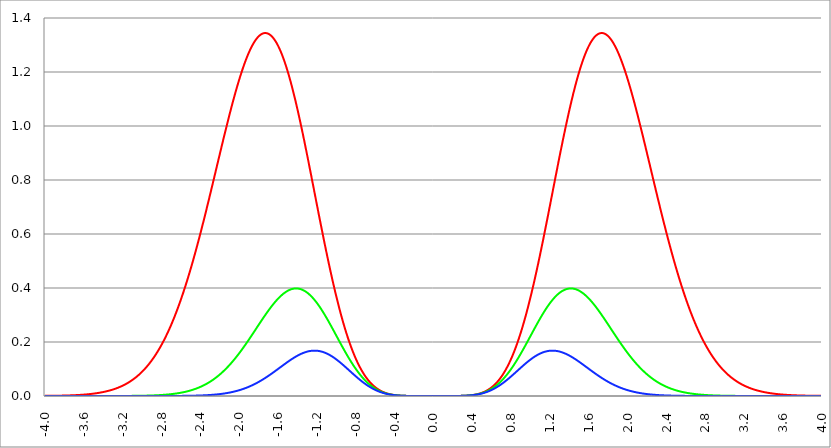
| Category | Series 1 | Series 0 | Series 2 |
|---|---|---|---|
| -4.0 | 0 | 0 | 0 |
| -3.996 | 0 | 0 | 0 |
| -3.992 | 0 | 0 | 0 |
| -3.988 | 0 | 0 | 0 |
| -3.984 | 0.001 | 0 | 0 |
| -3.98 | 0.001 | 0 | 0 |
| -3.976 | 0.001 | 0 | 0 |
| -3.972 | 0.001 | 0 | 0 |
| -3.968 | 0.001 | 0 | 0 |
| -3.964 | 0.001 | 0 | 0 |
| -3.96 | 0.001 | 0 | 0 |
| -3.956 | 0.001 | 0 | 0 |
| -3.952 | 0.001 | 0 | 0 |
| -3.948 | 0.001 | 0 | 0 |
| -3.944 | 0.001 | 0 | 0 |
| -3.94 | 0.001 | 0 | 0 |
| -3.936 | 0.001 | 0 | 0 |
| -3.932 | 0.001 | 0 | 0 |
| -3.928 | 0.001 | 0 | 0 |
| -3.924 | 0.001 | 0 | 0 |
| -3.92 | 0.001 | 0 | 0 |
| -3.916 | 0.001 | 0 | 0 |
| -3.912 | 0.001 | 0 | 0 |
| -3.908 | 0.001 | 0 | 0 |
| -3.904 | 0.001 | 0 | 0 |
| -3.9 | 0.001 | 0 | 0 |
| -3.896 | 0.001 | 0 | 0 |
| -3.892 | 0.001 | 0 | 0 |
| -3.888 | 0.001 | 0 | 0 |
| -3.884 | 0.001 | 0 | 0 |
| -3.88 | 0.001 | 0 | 0 |
| -3.876 | 0.001 | 0 | 0 |
| -3.872 | 0.001 | 0 | 0 |
| -3.868 | 0.001 | 0 | 0 |
| -3.864 | 0.001 | 0 | 0 |
| -3.86 | 0.001 | 0 | 0 |
| -3.856 | 0.001 | 0 | 0 |
| -3.852 | 0.001 | 0 | 0 |
| -3.848 | 0.001 | 0 | 0 |
| -3.844 | 0.001 | 0 | 0 |
| -3.84 | 0.001 | 0 | 0 |
| -3.836 | 0.001 | 0 | 0 |
| -3.832 | 0.001 | 0 | 0 |
| -3.828 | 0.001 | 0 | 0 |
| -3.824 | 0.001 | 0 | 0 |
| -3.82 | 0.001 | 0 | 0 |
| -3.816 | 0.001 | 0 | 0 |
| -3.812 | 0.001 | 0 | 0 |
| -3.808 | 0.002 | 0 | 0 |
| -3.804 | 0.002 | 0 | 0 |
| -3.8 | 0.002 | 0 | 0 |
| -3.796 | 0.002 | 0 | 0 |
| -3.792 | 0.002 | 0 | 0 |
| -3.788 | 0.002 | 0 | 0 |
| -3.784 | 0.002 | 0 | 0 |
| -3.78 | 0.002 | 0 | 0 |
| -3.776 | 0.002 | 0 | 0 |
| -3.772 | 0.002 | 0 | 0 |
| -3.768 | 0.002 | 0 | 0 |
| -3.764 | 0.002 | 0 | 0 |
| -3.76 | 0.002 | 0 | 0 |
| -3.756 | 0.002 | 0 | 0 |
| -3.752 | 0.002 | 0 | 0 |
| -3.748 | 0.002 | 0 | 0 |
| -3.744 | 0.002 | 0 | 0 |
| -3.74 | 0.002 | 0 | 0 |
| -3.736 | 0.002 | 0 | 0 |
| -3.732 | 0.002 | 0 | 0 |
| -3.728 | 0.002 | 0 | 0 |
| -3.724 | 0.003 | 0 | 0 |
| -3.72 | 0.003 | 0 | 0 |
| -3.716 | 0.003 | 0 | 0 |
| -3.712 | 0.003 | 0 | 0 |
| -3.708 | 0.003 | 0 | 0 |
| -3.704 | 0.003 | 0 | 0 |
| -3.7 | 0.003 | 0 | 0 |
| -3.696 | 0.003 | 0 | 0 |
| -3.692 | 0.003 | 0 | 0 |
| -3.688 | 0.003 | 0 | 0 |
| -3.684 | 0.003 | 0 | 0 |
| -3.68 | 0.003 | 0 | 0 |
| -3.676 | 0.003 | 0 | 0 |
| -3.672 | 0.003 | 0 | 0 |
| -3.668 | 0.003 | 0 | 0 |
| -3.664 | 0.004 | 0 | 0 |
| -3.66 | 0.004 | 0 | 0 |
| -3.656 | 0.004 | 0 | 0 |
| -3.652 | 0.004 | 0 | 0 |
| -3.648 | 0.004 | 0 | 0 |
| -3.644 | 0.004 | 0 | 0 |
| -3.64 | 0.004 | 0 | 0 |
| -3.636 | 0.004 | 0 | 0 |
| -3.632 | 0.004 | 0 | 0 |
| -3.628 | 0.004 | 0 | 0 |
| -3.624 | 0.004 | 0 | 0 |
| -3.62 | 0.005 | 0 | 0 |
| -3.616 | 0.005 | 0 | 0 |
| -3.612 | 0.005 | 0 | 0 |
| -3.608 | 0.005 | 0 | 0 |
| -3.604 | 0.005 | 0 | 0 |
| -3.6 | 0.005 | 0 | 0 |
| -3.596 | 0.005 | 0 | 0 |
| -3.592 | 0.005 | 0 | 0 |
| -3.588 | 0.005 | 0 | 0 |
| -3.584 | 0.006 | 0 | 0 |
| -3.58 | 0.006 | 0 | 0 |
| -3.576 | 0.006 | 0 | 0 |
| -3.572 | 0.006 | 0 | 0 |
| -3.568 | 0.006 | 0 | 0 |
| -3.564 | 0.006 | 0 | 0 |
| -3.56 | 0.006 | 0 | 0 |
| -3.556 | 0.007 | 0 | 0 |
| -3.552 | 0.007 | 0 | 0 |
| -3.548 | 0.007 | 0 | 0 |
| -3.544 | 0.007 | 0 | 0 |
| -3.54 | 0.007 | 0 | 0 |
| -3.536 | 0.007 | 0 | 0 |
| -3.532 | 0.007 | 0 | 0 |
| -3.528 | 0.008 | 0 | 0 |
| -3.524 | 0.008 | 0 | 0 |
| -3.52 | 0.008 | 0 | 0 |
| -3.516 | 0.008 | 0 | 0 |
| -3.512 | 0.008 | 0 | 0 |
| -3.508 | 0.008 | 0 | 0 |
| -3.504 | 0.009 | 0 | 0 |
| -3.5 | 0.009 | 0 | 0 |
| -3.496 | 0.009 | 0 | 0 |
| -3.492 | 0.009 | 0 | 0 |
| -3.488 | 0.009 | 0 | 0 |
| -3.484 | 0.01 | 0 | 0 |
| -3.48 | 0.01 | 0 | 0 |
| -3.476 | 0.01 | 0 | 0 |
| -3.472 | 0.01 | 0 | 0 |
| -3.467999999999999 | 0.01 | 0 | 0 |
| -3.463999999999999 | 0.011 | 0 | 0 |
| -3.459999999999999 | 0.011 | 0 | 0 |
| -3.455999999999999 | 0.011 | 0 | 0 |
| -3.451999999999999 | 0.011 | 0 | 0 |
| -3.447999999999999 | 0.012 | 0 | 0 |
| -3.443999999999999 | 0.012 | 0 | 0 |
| -3.439999999999999 | 0.012 | 0 | 0 |
| -3.435999999999999 | 0.012 | 0 | 0 |
| -3.431999999999999 | 0.013 | 0 | 0 |
| -3.427999999999999 | 0.013 | 0 | 0 |
| -3.423999999999999 | 0.013 | 0 | 0 |
| -3.419999999999999 | 0.013 | 0 | 0 |
| -3.415999999999999 | 0.014 | 0 | 0 |
| -3.411999999999999 | 0.014 | 0 | 0 |
| -3.407999999999999 | 0.014 | 0 | 0 |
| -3.403999999999999 | 0.014 | 0 | 0 |
| -3.399999999999999 | 0.015 | 0 | 0 |
| -3.395999999999999 | 0.015 | 0 | 0 |
| -3.391999999999999 | 0.015 | 0 | 0 |
| -3.387999999999999 | 0.016 | 0 | 0 |
| -3.383999999999999 | 0.016 | 0 | 0 |
| -3.379999999999999 | 0.016 | 0 | 0 |
| -3.375999999999999 | 0.017 | 0 | 0 |
| -3.371999999999999 | 0.017 | 0 | 0 |
| -3.367999999999999 | 0.017 | 0 | 0 |
| -3.363999999999999 | 0.018 | 0 | 0 |
| -3.359999999999999 | 0.018 | 0 | 0 |
| -3.355999999999999 | 0.018 | 0 | 0 |
| -3.351999999999999 | 0.019 | 0 | 0 |
| -3.347999999999999 | 0.019 | 0 | 0 |
| -3.343999999999999 | 0.019 | 0 | 0 |
| -3.339999999999999 | 0.02 | 0 | 0 |
| -3.335999999999999 | 0.02 | 0 | 0 |
| -3.331999999999999 | 0.021 | 0 | 0 |
| -3.327999999999999 | 0.021 | 0 | 0 |
| -3.323999999999999 | 0.021 | 0 | 0 |
| -3.319999999999999 | 0.022 | 0 | 0 |
| -3.315999999999999 | 0.022 | 0 | 0 |
| -3.311999999999999 | 0.023 | 0 | 0 |
| -3.307999999999999 | 0.023 | 0 | 0 |
| -3.303999999999999 | 0.024 | 0 | 0 |
| -3.299999999999999 | 0.024 | 0 | 0 |
| -3.295999999999999 | 0.025 | 0 | 0 |
| -3.291999999999999 | 0.025 | 0 | 0 |
| -3.288 | 0.025 | 0 | 0 |
| -3.284 | 0.026 | 0 | 0 |
| -3.279999999999999 | 0.026 | 0 | 0 |
| -3.275999999999999 | 0.027 | 0 | 0 |
| -3.271999999999999 | 0.027 | 0 | 0 |
| -3.268 | 0.028 | 0 | 0 |
| -3.264 | 0.029 | 0 | 0 |
| -3.259999999999999 | 0.029 | 0 | 0 |
| -3.255999999999999 | 0.03 | 0 | 0 |
| -3.251999999999999 | 0.03 | 0 | 0 |
| -3.248 | 0.031 | 0 | 0 |
| -3.244 | 0.031 | 0 | 0 |
| -3.239999999999999 | 0.032 | 0 | 0 |
| -3.235999999999999 | 0.033 | 0 | 0 |
| -3.231999999999999 | 0.033 | 0 | 0 |
| -3.228 | 0.034 | 0 | 0 |
| -3.224 | 0.034 | 0 | 0 |
| -3.219999999999999 | 0.035 | 0 | 0 |
| -3.215999999999999 | 0.036 | 0 | 0 |
| -3.211999999999999 | 0.036 | 0 | 0 |
| -3.208 | 0.037 | 0 | 0 |
| -3.204 | 0.038 | 0 | 0 |
| -3.199999999999999 | 0.038 | 0 | 0 |
| -3.195999999999999 | 0.039 | 0 | 0 |
| -3.191999999999999 | 0.04 | 0 | 0 |
| -3.188 | 0.04 | 0 | 0 |
| -3.184 | 0.041 | 0 | 0 |
| -3.179999999999999 | 0.042 | 0 | 0 |
| -3.175999999999999 | 0.043 | 0 | 0 |
| -3.171999999999999 | 0.043 | 0 | 0 |
| -3.168 | 0.044 | 0 | 0 |
| -3.164 | 0.045 | 0 | 0 |
| -3.159999999999999 | 0.046 | 0 | 0 |
| -3.155999999999999 | 0.047 | 0 | 0 |
| -3.151999999999999 | 0.048 | 0 | 0 |
| -3.148 | 0.048 | 0 | 0 |
| -3.144 | 0.049 | 0 | 0 |
| -3.139999999999999 | 0.05 | 0 | 0 |
| -3.135999999999999 | 0.051 | 0 | 0 |
| -3.131999999999999 | 0.052 | 0 | 0 |
| -3.128 | 0.053 | 0 | 0 |
| -3.124 | 0.054 | 0 | 0 |
| -3.119999999999999 | 0.055 | 0 | 0 |
| -3.115999999999999 | 0.056 | 0 | 0 |
| -3.111999999999999 | 0.057 | 0 | 0 |
| -3.108 | 0.058 | 0 | 0 |
| -3.104 | 0.059 | 0 | 0 |
| -3.099999999999999 | 0.06 | 0 | 0 |
| -3.095999999999999 | 0.061 | 0.001 | 0 |
| -3.091999999999999 | 0.062 | 0.001 | 0 |
| -3.088 | 0.063 | 0.001 | 0 |
| -3.084 | 0.064 | 0.001 | 0 |
| -3.079999999999999 | 0.065 | 0.001 | 0 |
| -3.075999999999999 | 0.066 | 0.001 | 0 |
| -3.071999999999999 | 0.067 | 0.001 | 0 |
| -3.068 | 0.068 | 0.001 | 0 |
| -3.064 | 0.069 | 0.001 | 0 |
| -3.059999999999999 | 0.07 | 0.001 | 0 |
| -3.055999999999999 | 0.072 | 0.001 | 0 |
| -3.051999999999999 | 0.073 | 0.001 | 0 |
| -3.048 | 0.074 | 0.001 | 0 |
| -3.044 | 0.075 | 0.001 | 0 |
| -3.039999999999999 | 0.077 | 0.001 | 0 |
| -3.035999999999999 | 0.078 | 0.001 | 0 |
| -3.031999999999999 | 0.079 | 0.001 | 0 |
| -3.028 | 0.08 | 0.001 | 0 |
| -3.024 | 0.082 | 0.001 | 0 |
| -3.019999999999999 | 0.083 | 0.001 | 0 |
| -3.015999999999999 | 0.084 | 0.001 | 0 |
| -3.011999999999999 | 0.086 | 0.001 | 0 |
| -3.008 | 0.087 | 0.001 | 0 |
| -3.004 | 0.089 | 0.001 | 0 |
| -2.999999999999999 | 0.09 | 0.001 | 0 |
| -2.995999999999999 | 0.091 | 0.001 | 0 |
| -2.991999999999999 | 0.093 | 0.001 | 0 |
| -2.988 | 0.094 | 0.001 | 0 |
| -2.984 | 0.096 | 0.001 | 0 |
| -2.979999999999999 | 0.097 | 0.001 | 0 |
| -2.975999999999999 | 0.099 | 0.001 | 0 |
| -2.971999999999999 | 0.101 | 0.001 | 0 |
| -2.968 | 0.102 | 0.001 | 0 |
| -2.964 | 0.104 | 0.001 | 0 |
| -2.959999999999999 | 0.105 | 0.001 | 0 |
| -2.955999999999999 | 0.107 | 0.001 | 0 |
| -2.951999999999999 | 0.109 | 0.001 | 0 |
| -2.948 | 0.11 | 0.001 | 0 |
| -2.944 | 0.112 | 0.001 | 0 |
| -2.939999999999999 | 0.114 | 0.002 | 0 |
| -2.935999999999999 | 0.116 | 0.002 | 0 |
| -2.931999999999999 | 0.117 | 0.002 | 0 |
| -2.928 | 0.119 | 0.002 | 0 |
| -2.924 | 0.121 | 0.002 | 0 |
| -2.919999999999999 | 0.123 | 0.002 | 0 |
| -2.915999999999999 | 0.125 | 0.002 | 0 |
| -2.911999999999999 | 0.127 | 0.002 | 0 |
| -2.908 | 0.129 | 0.002 | 0 |
| -2.904 | 0.13 | 0.002 | 0 |
| -2.899999999999999 | 0.132 | 0.002 | 0 |
| -2.895999999999999 | 0.134 | 0.002 | 0 |
| -2.891999999999999 | 0.136 | 0.002 | 0 |
| -2.887999999999999 | 0.138 | 0.002 | 0 |
| -2.883999999999999 | 0.141 | 0.002 | 0 |
| -2.879999999999999 | 0.143 | 0.002 | 0 |
| -2.875999999999999 | 0.145 | 0.002 | 0 |
| -2.871999999999999 | 0.147 | 0.002 | 0 |
| -2.867999999999999 | 0.149 | 0.002 | 0 |
| -2.863999999999999 | 0.151 | 0.003 | 0 |
| -2.859999999999999 | 0.153 | 0.003 | 0 |
| -2.855999999999999 | 0.156 | 0.003 | 0 |
| -2.851999999999999 | 0.158 | 0.003 | 0 |
| -2.847999999999999 | 0.16 | 0.003 | 0 |
| -2.843999999999999 | 0.163 | 0.003 | 0 |
| -2.839999999999999 | 0.165 | 0.003 | 0 |
| -2.835999999999999 | 0.167 | 0.003 | 0 |
| -2.831999999999999 | 0.17 | 0.003 | 0 |
| -2.827999999999999 | 0.172 | 0.003 | 0 |
| -2.823999999999999 | 0.174 | 0.003 | 0 |
| -2.819999999999999 | 0.177 | 0.003 | 0 |
| -2.815999999999999 | 0.179 | 0.003 | 0 |
| -2.811999999999999 | 0.182 | 0.003 | 0 |
| -2.807999999999999 | 0.185 | 0.004 | 0 |
| -2.803999999999999 | 0.187 | 0.004 | 0 |
| -2.799999999999999 | 0.19 | 0.004 | 0 |
| -2.795999999999999 | 0.192 | 0.004 | 0 |
| -2.791999999999999 | 0.195 | 0.004 | 0 |
| -2.787999999999999 | 0.198 | 0.004 | 0 |
| -2.783999999999999 | 0.2 | 0.004 | 0 |
| -2.779999999999999 | 0.203 | 0.004 | 0 |
| -2.775999999999999 | 0.206 | 0.004 | 0 |
| -2.771999999999999 | 0.209 | 0.004 | 0 |
| -2.767999999999999 | 0.212 | 0.005 | 0 |
| -2.763999999999999 | 0.214 | 0.005 | 0 |
| -2.759999999999999 | 0.217 | 0.005 | 0 |
| -2.755999999999999 | 0.22 | 0.005 | 0 |
| -2.751999999999999 | 0.223 | 0.005 | 0 |
| -2.747999999999999 | 0.226 | 0.005 | 0 |
| -2.743999999999999 | 0.229 | 0.005 | 0 |
| -2.739999999999999 | 0.232 | 0.005 | 0 |
| -2.735999999999999 | 0.235 | 0.006 | 0 |
| -2.731999999999999 | 0.238 | 0.006 | 0 |
| -2.727999999999999 | 0.242 | 0.006 | 0 |
| -2.723999999999999 | 0.245 | 0.006 | 0 |
| -2.719999999999999 | 0.248 | 0.006 | 0 |
| -2.715999999999999 | 0.251 | 0.006 | 0 |
| -2.711999999999999 | 0.254 | 0.006 | 0 |
| -2.707999999999999 | 0.258 | 0.007 | 0 |
| -2.703999999999999 | 0.261 | 0.007 | 0 |
| -2.699999999999999 | 0.264 | 0.007 | 0 |
| -2.695999999999999 | 0.268 | 0.007 | 0 |
| -2.691999999999999 | 0.271 | 0.007 | 0 |
| -2.687999999999999 | 0.275 | 0.007 | 0 |
| -2.683999999999999 | 0.278 | 0.008 | 0 |
| -2.679999999999999 | 0.282 | 0.008 | 0 |
| -2.675999999999999 | 0.285 | 0.008 | 0 |
| -2.671999999999999 | 0.289 | 0.008 | 0 |
| -2.667999999999999 | 0.292 | 0.008 | 0 |
| -2.663999999999999 | 0.296 | 0.009 | 0 |
| -2.659999999999999 | 0.299 | 0.009 | 0 |
| -2.655999999999999 | 0.303 | 0.009 | 0 |
| -2.651999999999999 | 0.307 | 0.009 | 0 |
| -2.647999999999999 | 0.311 | 0.009 | 0 |
| -2.643999999999999 | 0.314 | 0.01 | 0 |
| -2.639999999999999 | 0.318 | 0.01 | 0 |
| -2.635999999999999 | 0.322 | 0.01 | 0 |
| -2.631999999999999 | 0.326 | 0.01 | 0 |
| -2.627999999999999 | 0.33 | 0.01 | 0 |
| -2.623999999999999 | 0.334 | 0.011 | 0 |
| -2.619999999999999 | 0.338 | 0.011 | 0 |
| -2.615999999999999 | 0.342 | 0.011 | 0 |
| -2.611999999999999 | 0.346 | 0.011 | 0 |
| -2.607999999999999 | 0.35 | 0.012 | 0 |
| -2.603999999999999 | 0.354 | 0.012 | 0 |
| -2.599999999999999 | 0.358 | 0.012 | 0 |
| -2.595999999999999 | 0.362 | 0.012 | 0 |
| -2.591999999999999 | 0.366 | 0.013 | 0 |
| -2.587999999999999 | 0.371 | 0.013 | 0 |
| -2.583999999999999 | 0.375 | 0.013 | 0 |
| -2.579999999999999 | 0.379 | 0.014 | 0 |
| -2.575999999999999 | 0.384 | 0.014 | 0.001 |
| -2.571999999999999 | 0.388 | 0.014 | 0.001 |
| -2.567999999999999 | 0.392 | 0.015 | 0.001 |
| -2.563999999999999 | 0.397 | 0.015 | 0.001 |
| -2.559999999999999 | 0.401 | 0.015 | 0.001 |
| -2.555999999999999 | 0.406 | 0.015 | 0.001 |
| -2.551999999999999 | 0.41 | 0.016 | 0.001 |
| -2.547999999999999 | 0.415 | 0.016 | 0.001 |
| -2.543999999999999 | 0.419 | 0.016 | 0.001 |
| -2.539999999999999 | 0.424 | 0.017 | 0.001 |
| -2.535999999999999 | 0.428 | 0.017 | 0.001 |
| -2.531999999999999 | 0.433 | 0.018 | 0.001 |
| -2.527999999999999 | 0.438 | 0.018 | 0.001 |
| -2.523999999999999 | 0.442 | 0.018 | 0.001 |
| -2.519999999999999 | 0.447 | 0.019 | 0.001 |
| -2.515999999999999 | 0.452 | 0.019 | 0.001 |
| -2.511999999999999 | 0.457 | 0.019 | 0.001 |
| -2.507999999999999 | 0.462 | 0.02 | 0.001 |
| -2.503999999999999 | 0.466 | 0.02 | 0.001 |
| -2.499999999999999 | 0.471 | 0.021 | 0.001 |
| -2.495999999999999 | 0.476 | 0.021 | 0.001 |
| -2.491999999999999 | 0.481 | 0.022 | 0.001 |
| -2.487999999999999 | 0.486 | 0.022 | 0.001 |
| -2.483999999999999 | 0.491 | 0.022 | 0.001 |
| -2.479999999999999 | 0.496 | 0.023 | 0.001 |
| -2.475999999999999 | 0.501 | 0.023 | 0.001 |
| -2.471999999999999 | 0.506 | 0.024 | 0.001 |
| -2.467999999999999 | 0.511 | 0.024 | 0.001 |
| -2.463999999999999 | 0.517 | 0.025 | 0.001 |
| -2.459999999999999 | 0.522 | 0.025 | 0.001 |
| -2.455999999999999 | 0.527 | 0.026 | 0.001 |
| -2.451999999999999 | 0.532 | 0.026 | 0.001 |
| -2.447999999999999 | 0.537 | 0.027 | 0.001 |
| -2.443999999999999 | 0.543 | 0.027 | 0.001 |
| -2.439999999999999 | 0.548 | 0.028 | 0.001 |
| -2.435999999999999 | 0.553 | 0.028 | 0.001 |
| -2.431999999999999 | 0.559 | 0.029 | 0.002 |
| -2.427999999999999 | 0.564 | 0.03 | 0.002 |
| -2.423999999999999 | 0.569 | 0.03 | 0.002 |
| -2.419999999999999 | 0.575 | 0.031 | 0.002 |
| -2.415999999999999 | 0.58 | 0.031 | 0.002 |
| -2.411999999999999 | 0.586 | 0.032 | 0.002 |
| -2.407999999999999 | 0.591 | 0.033 | 0.002 |
| -2.403999999999999 | 0.597 | 0.033 | 0.002 |
| -2.399999999999999 | 0.602 | 0.034 | 0.002 |
| -2.395999999999999 | 0.608 | 0.034 | 0.002 |
| -2.391999999999999 | 0.613 | 0.035 | 0.002 |
| -2.387999999999999 | 0.619 | 0.036 | 0.002 |
| -2.383999999999999 | 0.625 | 0.036 | 0.002 |
| -2.379999999999999 | 0.63 | 0.037 | 0.002 |
| -2.375999999999999 | 0.636 | 0.038 | 0.002 |
| -2.371999999999999 | 0.641 | 0.038 | 0.002 |
| -2.367999999999998 | 0.647 | 0.039 | 0.002 |
| -2.363999999999998 | 0.653 | 0.04 | 0.002 |
| -2.359999999999998 | 0.659 | 0.041 | 0.003 |
| -2.355999999999998 | 0.664 | 0.041 | 0.003 |
| -2.351999999999998 | 0.67 | 0.042 | 0.003 |
| -2.347999999999998 | 0.676 | 0.043 | 0.003 |
| -2.343999999999998 | 0.682 | 0.044 | 0.003 |
| -2.339999999999998 | 0.687 | 0.044 | 0.003 |
| -2.335999999999998 | 0.693 | 0.045 | 0.003 |
| -2.331999999999998 | 0.699 | 0.046 | 0.003 |
| -2.327999999999998 | 0.705 | 0.047 | 0.003 |
| -2.323999999999998 | 0.711 | 0.048 | 0.003 |
| -2.319999999999998 | 0.717 | 0.049 | 0.003 |
| -2.315999999999998 | 0.723 | 0.049 | 0.003 |
| -2.311999999999998 | 0.729 | 0.05 | 0.003 |
| -2.307999999999998 | 0.734 | 0.051 | 0.004 |
| -2.303999999999998 | 0.74 | 0.052 | 0.004 |
| -2.299999999999998 | 0.746 | 0.053 | 0.004 |
| -2.295999999999998 | 0.752 | 0.054 | 0.004 |
| -2.291999999999998 | 0.758 | 0.055 | 0.004 |
| -2.287999999999998 | 0.764 | 0.056 | 0.004 |
| -2.283999999999998 | 0.77 | 0.057 | 0.004 |
| -2.279999999999998 | 0.776 | 0.058 | 0.004 |
| -2.275999999999998 | 0.782 | 0.059 | 0.004 |
| -2.271999999999998 | 0.788 | 0.06 | 0.005 |
| -2.267999999999998 | 0.794 | 0.061 | 0.005 |
| -2.263999999999998 | 0.8 | 0.062 | 0.005 |
| -2.259999999999998 | 0.806 | 0.063 | 0.005 |
| -2.255999999999998 | 0.812 | 0.064 | 0.005 |
| -2.251999999999998 | 0.818 | 0.065 | 0.005 |
| -2.247999999999998 | 0.824 | 0.066 | 0.005 |
| -2.243999999999998 | 0.83 | 0.067 | 0.005 |
| -2.239999999999998 | 0.836 | 0.068 | 0.006 |
| -2.235999999999998 | 0.842 | 0.069 | 0.006 |
| -2.231999999999998 | 0.848 | 0.07 | 0.006 |
| -2.227999999999998 | 0.854 | 0.071 | 0.006 |
| -2.223999999999998 | 0.86 | 0.073 | 0.006 |
| -2.219999999999998 | 0.866 | 0.074 | 0.006 |
| -2.215999999999998 | 0.872 | 0.075 | 0.006 |
| -2.211999999999998 | 0.878 | 0.076 | 0.007 |
| -2.207999999999998 | 0.884 | 0.077 | 0.007 |
| -2.203999999999998 | 0.89 | 0.078 | 0.007 |
| -2.199999999999998 | 0.897 | 0.08 | 0.007 |
| -2.195999999999998 | 0.902 | 0.081 | 0.007 |
| -2.191999999999998 | 0.908 | 0.082 | 0.007 |
| -2.187999999999998 | 0.914 | 0.083 | 0.008 |
| -2.183999999999998 | 0.92 | 0.085 | 0.008 |
| -2.179999999999998 | 0.926 | 0.086 | 0.008 |
| -2.175999999999998 | 0.932 | 0.087 | 0.008 |
| -2.171999999999998 | 0.938 | 0.089 | 0.008 |
| -2.167999999999998 | 0.944 | 0.09 | 0.009 |
| -2.163999999999998 | 0.95 | 0.091 | 0.009 |
| -2.159999999999998 | 0.956 | 0.093 | 0.009 |
| -2.155999999999998 | 0.962 | 0.094 | 0.009 |
| -2.151999999999998 | 0.968 | 0.096 | 0.009 |
| -2.147999999999998 | 0.974 | 0.097 | 0.01 |
| -2.143999999999998 | 0.98 | 0.098 | 0.01 |
| -2.139999999999998 | 0.985 | 0.1 | 0.01 |
| -2.135999999999998 | 0.991 | 0.101 | 0.01 |
| -2.131999999999998 | 0.997 | 0.103 | 0.011 |
| -2.127999999999998 | 1.003 | 0.104 | 0.011 |
| -2.123999999999998 | 1.008 | 0.106 | 0.011 |
| -2.119999999999998 | 1.014 | 0.107 | 0.011 |
| -2.115999999999998 | 1.02 | 0.109 | 0.012 |
| -2.111999999999998 | 1.026 | 0.11 | 0.012 |
| -2.107999999999998 | 1.031 | 0.112 | 0.012 |
| -2.103999999999998 | 1.037 | 0.113 | 0.012 |
| -2.099999999999998 | 1.043 | 0.115 | 0.013 |
| -2.095999999999998 | 1.048 | 0.117 | 0.013 |
| -2.091999999999998 | 1.054 | 0.118 | 0.013 |
| -2.087999999999998 | 1.059 | 0.12 | 0.014 |
| -2.083999999999998 | 1.065 | 0.121 | 0.014 |
| -2.079999999999998 | 1.07 | 0.123 | 0.014 |
| -2.075999999999998 | 1.076 | 0.125 | 0.014 |
| -2.071999999999998 | 1.081 | 0.126 | 0.015 |
| -2.067999999999998 | 1.086 | 0.128 | 0.015 |
| -2.063999999999998 | 1.092 | 0.13 | 0.015 |
| -2.059999999999998 | 1.097 | 0.131 | 0.016 |
| -2.055999999999998 | 1.102 | 0.133 | 0.016 |
| -2.051999999999998 | 1.108 | 0.135 | 0.016 |
| -2.047999999999998 | 1.113 | 0.137 | 0.017 |
| -2.043999999999998 | 1.118 | 0.138 | 0.017 |
| -2.039999999999998 | 1.123 | 0.14 | 0.018 |
| -2.035999999999998 | 1.128 | 0.142 | 0.018 |
| -2.031999999999998 | 1.133 | 0.144 | 0.018 |
| -2.027999999999998 | 1.138 | 0.146 | 0.019 |
| -2.023999999999998 | 1.143 | 0.147 | 0.019 |
| -2.019999999999998 | 1.148 | 0.149 | 0.019 |
| -2.015999999999998 | 1.153 | 0.151 | 0.02 |
| -2.011999999999998 | 1.158 | 0.153 | 0.02 |
| -2.007999999999998 | 1.163 | 0.155 | 0.021 |
| -2.003999999999998 | 1.167 | 0.157 | 0.021 |
| -1.999999999999998 | 1.172 | 0.159 | 0.021 |
| -1.995999999999998 | 1.177 | 0.161 | 0.022 |
| -1.991999999999998 | 1.181 | 0.162 | 0.022 |
| -1.987999999999998 | 1.186 | 0.164 | 0.023 |
| -1.983999999999998 | 1.191 | 0.166 | 0.023 |
| -1.979999999999998 | 1.195 | 0.168 | 0.024 |
| -1.975999999999998 | 1.199 | 0.17 | 0.024 |
| -1.971999999999998 | 1.204 | 0.172 | 0.025 |
| -1.967999999999998 | 1.208 | 0.174 | 0.025 |
| -1.963999999999998 | 1.212 | 0.176 | 0.026 |
| -1.959999999999998 | 1.217 | 0.178 | 0.026 |
| -1.955999999999998 | 1.221 | 0.18 | 0.027 |
| -1.951999999999998 | 1.225 | 0.182 | 0.027 |
| -1.947999999999998 | 1.229 | 0.184 | 0.028 |
| -1.943999999999998 | 1.233 | 0.186 | 0.028 |
| -1.939999999999998 | 1.237 | 0.188 | 0.029 |
| -1.935999999999998 | 1.241 | 0.19 | 0.029 |
| -1.931999999999998 | 1.244 | 0.193 | 0.03 |
| -1.927999999999998 | 1.248 | 0.195 | 0.03 |
| -1.923999999999998 | 1.252 | 0.197 | 0.031 |
| -1.919999999999998 | 1.256 | 0.199 | 0.031 |
| -1.915999999999998 | 1.259 | 0.201 | 0.032 |
| -1.911999999999998 | 1.263 | 0.203 | 0.033 |
| -1.907999999999998 | 1.266 | 0.205 | 0.033 |
| -1.903999999999998 | 1.269 | 0.207 | 0.034 |
| -1.899999999999998 | 1.273 | 0.209 | 0.034 |
| -1.895999999999998 | 1.276 | 0.211 | 0.035 |
| -1.891999999999998 | 1.279 | 0.214 | 0.036 |
| -1.887999999999998 | 1.282 | 0.216 | 0.036 |
| -1.883999999999998 | 1.285 | 0.218 | 0.037 |
| -1.879999999999998 | 1.288 | 0.22 | 0.038 |
| -1.875999999999998 | 1.291 | 0.222 | 0.038 |
| -1.871999999999998 | 1.294 | 0.224 | 0.039 |
| -1.867999999999998 | 1.297 | 0.227 | 0.04 |
| -1.863999999999998 | 1.299 | 0.229 | 0.04 |
| -1.859999999999998 | 1.302 | 0.231 | 0.041 |
| -1.855999999999998 | 1.304 | 0.233 | 0.042 |
| -1.851999999999998 | 1.307 | 0.235 | 0.042 |
| -1.847999999999998 | 1.309 | 0.237 | 0.043 |
| -1.843999999999998 | 1.312 | 0.24 | 0.044 |
| -1.839999999999998 | 1.314 | 0.242 | 0.044 |
| -1.835999999999998 | 1.316 | 0.244 | 0.045 |
| -1.831999999999998 | 1.318 | 0.246 | 0.046 |
| -1.827999999999998 | 1.32 | 0.248 | 0.047 |
| -1.823999999999998 | 1.322 | 0.251 | 0.047 |
| -1.819999999999998 | 1.324 | 0.253 | 0.048 |
| -1.815999999999998 | 1.326 | 0.255 | 0.049 |
| -1.811999999999998 | 1.327 | 0.257 | 0.05 |
| -1.807999999999998 | 1.329 | 0.259 | 0.051 |
| -1.803999999999998 | 1.331 | 0.261 | 0.051 |
| -1.799999999999998 | 1.332 | 0.264 | 0.052 |
| -1.795999999999998 | 1.333 | 0.266 | 0.053 |
| -1.791999999999998 | 1.335 | 0.268 | 0.054 |
| -1.787999999999998 | 1.336 | 0.27 | 0.055 |
| -1.783999999999998 | 1.337 | 0.272 | 0.055 |
| -1.779999999999998 | 1.338 | 0.274 | 0.056 |
| -1.775999999999998 | 1.339 | 0.277 | 0.057 |
| -1.771999999999998 | 1.34 | 0.279 | 0.058 |
| -1.767999999999998 | 1.341 | 0.281 | 0.059 |
| -1.763999999999998 | 1.342 | 0.283 | 0.06 |
| -1.759999999999998 | 1.342 | 0.285 | 0.061 |
| -1.755999999999998 | 1.343 | 0.287 | 0.061 |
| -1.751999999999998 | 1.343 | 0.289 | 0.062 |
| -1.747999999999998 | 1.344 | 0.292 | 0.063 |
| -1.743999999999998 | 1.344 | 0.294 | 0.064 |
| -1.739999999999998 | 1.344 | 0.296 | 0.065 |
| -1.735999999999998 | 1.344 | 0.298 | 0.066 |
| -1.731999999999998 | 1.344 | 0.3 | 0.067 |
| -1.727999999999998 | 1.344 | 0.302 | 0.068 |
| -1.723999999999998 | 1.344 | 0.304 | 0.069 |
| -1.719999999999998 | 1.344 | 0.306 | 0.07 |
| -1.715999999999998 | 1.344 | 0.308 | 0.071 |
| -1.711999999999998 | 1.343 | 0.31 | 0.072 |
| -1.707999999999998 | 1.343 | 0.312 | 0.073 |
| -1.703999999999998 | 1.342 | 0.314 | 0.074 |
| -1.699999999999998 | 1.341 | 0.316 | 0.075 |
| -1.695999999999998 | 1.341 | 0.318 | 0.076 |
| -1.691999999999998 | 1.34 | 0.32 | 0.077 |
| -1.687999999999998 | 1.339 | 0.322 | 0.078 |
| -1.683999999999998 | 1.338 | 0.324 | 0.078 |
| -1.679999999999998 | 1.337 | 0.326 | 0.079 |
| -1.675999999999998 | 1.336 | 0.328 | 0.081 |
| -1.671999999999998 | 1.334 | 0.33 | 0.082 |
| -1.667999999999998 | 1.333 | 0.332 | 0.083 |
| -1.663999999999998 | 1.332 | 0.334 | 0.084 |
| -1.659999999999998 | 1.33 | 0.335 | 0.085 |
| -1.655999999999998 | 1.329 | 0.337 | 0.086 |
| -1.651999999999998 | 1.327 | 0.339 | 0.087 |
| -1.647999999999998 | 1.325 | 0.341 | 0.088 |
| -1.643999999999998 | 1.323 | 0.343 | 0.089 |
| -1.639999999999998 | 1.321 | 0.344 | 0.09 |
| -1.635999999999998 | 1.319 | 0.346 | 0.091 |
| -1.631999999999998 | 1.317 | 0.348 | 0.092 |
| -1.627999999999998 | 1.315 | 0.349 | 0.093 |
| -1.623999999999998 | 1.313 | 0.351 | 0.094 |
| -1.619999999999998 | 1.31 | 0.353 | 0.095 |
| -1.615999999999998 | 1.308 | 0.354 | 0.096 |
| -1.611999999999998 | 1.305 | 0.356 | 0.097 |
| -1.607999999999998 | 1.302 | 0.358 | 0.098 |
| -1.603999999999998 | 1.3 | 0.359 | 0.099 |
| -1.599999999999998 | 1.297 | 0.361 | 0.1 |
| -1.595999999999998 | 1.294 | 0.362 | 0.101 |
| -1.591999999999998 | 1.291 | 0.364 | 0.102 |
| -1.587999999999998 | 1.288 | 0.365 | 0.103 |
| -1.583999999999998 | 1.285 | 0.366 | 0.105 |
| -1.579999999999998 | 1.282 | 0.368 | 0.106 |
| -1.575999999999998 | 1.278 | 0.369 | 0.107 |
| -1.571999999999998 | 1.275 | 0.371 | 0.108 |
| -1.567999999999998 | 1.271 | 0.372 | 0.109 |
| -1.563999999999998 | 1.268 | 0.373 | 0.11 |
| -1.559999999999998 | 1.264 | 0.374 | 0.111 |
| -1.555999999999998 | 1.261 | 0.376 | 0.112 |
| -1.551999999999998 | 1.257 | 0.377 | 0.113 |
| -1.547999999999998 | 1.253 | 0.378 | 0.114 |
| -1.543999999999998 | 1.249 | 0.379 | 0.115 |
| -1.539999999999998 | 1.245 | 0.38 | 0.116 |
| -1.535999999999998 | 1.241 | 0.381 | 0.117 |
| -1.531999999999998 | 1.237 | 0.382 | 0.118 |
| -1.527999999999998 | 1.232 | 0.383 | 0.119 |
| -1.523999999999998 | 1.228 | 0.384 | 0.12 |
| -1.519999999999998 | 1.224 | 0.385 | 0.121 |
| -1.515999999999998 | 1.219 | 0.386 | 0.122 |
| -1.511999999999998 | 1.215 | 0.387 | 0.123 |
| -1.507999999999998 | 1.21 | 0.388 | 0.125 |
| -1.503999999999998 | 1.205 | 0.389 | 0.126 |
| -1.499999999999998 | 1.201 | 0.39 | 0.127 |
| -1.495999999999998 | 1.196 | 0.391 | 0.128 |
| -1.491999999999998 | 1.191 | 0.391 | 0.129 |
| -1.487999999999998 | 1.186 | 0.392 | 0.13 |
| -1.483999999999998 | 1.181 | 0.393 | 0.131 |
| -1.479999999999998 | 1.176 | 0.393 | 0.132 |
| -1.475999999999998 | 1.171 | 0.394 | 0.133 |
| -1.471999999999998 | 1.165 | 0.394 | 0.133 |
| -1.467999999999998 | 1.16 | 0.395 | 0.134 |
| -1.463999999999998 | 1.155 | 0.395 | 0.135 |
| -1.459999999999998 | 1.149 | 0.396 | 0.136 |
| -1.455999999999998 | 1.144 | 0.396 | 0.137 |
| -1.451999999999998 | 1.138 | 0.397 | 0.138 |
| -1.447999999999998 | 1.132 | 0.397 | 0.139 |
| -1.443999999999998 | 1.127 | 0.397 | 0.14 |
| -1.439999999999998 | 1.121 | 0.398 | 0.141 |
| -1.435999999999998 | 1.115 | 0.398 | 0.142 |
| -1.431999999999998 | 1.109 | 0.398 | 0.143 |
| -1.427999999999998 | 1.103 | 0.398 | 0.144 |
| -1.423999999999998 | 1.098 | 0.398 | 0.144 |
| -1.419999999999998 | 1.091 | 0.398 | 0.145 |
| -1.415999999999998 | 1.085 | 0.398 | 0.146 |
| -1.411999999999998 | 1.079 | 0.398 | 0.147 |
| -1.407999999999998 | 1.073 | 0.398 | 0.148 |
| -1.403999999999998 | 1.067 | 0.398 | 0.149 |
| -1.399999999999998 | 1.061 | 0.398 | 0.149 |
| -1.395999999999998 | 1.054 | 0.398 | 0.15 |
| -1.391999999999998 | 1.048 | 0.398 | 0.151 |
| -1.387999999999998 | 1.041 | 0.397 | 0.152 |
| -1.383999999999998 | 1.035 | 0.397 | 0.152 |
| -1.379999999999998 | 1.028 | 0.397 | 0.153 |
| -1.375999999999998 | 1.022 | 0.397 | 0.154 |
| -1.371999999999998 | 1.015 | 0.396 | 0.155 |
| -1.367999999999998 | 1.009 | 0.396 | 0.155 |
| -1.363999999999998 | 1.002 | 0.395 | 0.156 |
| -1.359999999999998 | 0.995 | 0.395 | 0.157 |
| -1.355999999999998 | 0.989 | 0.394 | 0.157 |
| -1.351999999999998 | 0.982 | 0.394 | 0.158 |
| -1.347999999999998 | 0.975 | 0.393 | 0.158 |
| -1.343999999999998 | 0.968 | 0.392 | 0.159 |
| -1.339999999999998 | 0.961 | 0.392 | 0.16 |
| -1.335999999999998 | 0.954 | 0.391 | 0.16 |
| -1.331999999999998 | 0.947 | 0.39 | 0.161 |
| -1.327999999999998 | 0.94 | 0.389 | 0.161 |
| -1.323999999999998 | 0.933 | 0.388 | 0.162 |
| -1.319999999999998 | 0.926 | 0.388 | 0.162 |
| -1.315999999999998 | 0.919 | 0.387 | 0.163 |
| -1.311999999999998 | 0.912 | 0.386 | 0.163 |
| -1.307999999999998 | 0.905 | 0.385 | 0.164 |
| -1.303999999999998 | 0.898 | 0.384 | 0.164 |
| -1.299999999999998 | 0.891 | 0.383 | 0.164 |
| -1.295999999999998 | 0.883 | 0.381 | 0.165 |
| -1.291999999999998 | 0.876 | 0.38 | 0.165 |
| -1.287999999999998 | 0.869 | 0.379 | 0.165 |
| -1.283999999999998 | 0.862 | 0.378 | 0.166 |
| -1.279999999999998 | 0.854 | 0.377 | 0.166 |
| -1.275999999999998 | 0.847 | 0.375 | 0.166 |
| -1.271999999999998 | 0.84 | 0.374 | 0.167 |
| -1.267999999999998 | 0.833 | 0.373 | 0.167 |
| -1.263999999999998 | 0.825 | 0.371 | 0.167 |
| -1.259999999999998 | 0.818 | 0.37 | 0.167 |
| -1.255999999999998 | 0.811 | 0.368 | 0.167 |
| -1.251999999999998 | 0.803 | 0.367 | 0.168 |
| -1.247999999999998 | 0.796 | 0.365 | 0.168 |
| -1.243999999999998 | 0.789 | 0.364 | 0.168 |
| -1.239999999999998 | 0.781 | 0.362 | 0.168 |
| -1.235999999999998 | 0.774 | 0.361 | 0.168 |
| -1.231999999999998 | 0.766 | 0.359 | 0.168 |
| -1.227999999999998 | 0.759 | 0.357 | 0.168 |
| -1.223999999999998 | 0.752 | 0.355 | 0.168 |
| -1.219999999999998 | 0.744 | 0.354 | 0.168 |
| -1.215999999999998 | 0.737 | 0.352 | 0.168 |
| -1.211999999999998 | 0.73 | 0.35 | 0.168 |
| -1.207999999999998 | 0.722 | 0.348 | 0.168 |
| -1.203999999999998 | 0.715 | 0.346 | 0.168 |
| -1.199999999999997 | 0.707 | 0.344 | 0.168 |
| -1.195999999999997 | 0.7 | 0.342 | 0.167 |
| -1.191999999999997 | 0.693 | 0.34 | 0.167 |
| -1.187999999999997 | 0.685 | 0.338 | 0.167 |
| -1.183999999999997 | 0.678 | 0.336 | 0.167 |
| -1.179999999999997 | 0.671 | 0.334 | 0.167 |
| -1.175999999999997 | 0.663 | 0.332 | 0.166 |
| -1.171999999999997 | 0.656 | 0.33 | 0.166 |
| -1.167999999999997 | 0.649 | 0.328 | 0.166 |
| -1.163999999999997 | 0.642 | 0.326 | 0.166 |
| -1.159999999999997 | 0.634 | 0.324 | 0.165 |
| -1.155999999999997 | 0.627 | 0.322 | 0.165 |
| -1.151999999999997 | 0.62 | 0.319 | 0.164 |
| -1.147999999999997 | 0.613 | 0.317 | 0.164 |
| -1.143999999999997 | 0.606 | 0.315 | 0.164 |
| -1.139999999999997 | 0.598 | 0.312 | 0.163 |
| -1.135999999999997 | 0.591 | 0.31 | 0.163 |
| -1.131999999999997 | 0.584 | 0.308 | 0.162 |
| -1.127999999999997 | 0.577 | 0.305 | 0.162 |
| -1.123999999999997 | 0.57 | 0.303 | 0.161 |
| -1.119999999999997 | 0.563 | 0.301 | 0.161 |
| -1.115999999999997 | 0.556 | 0.298 | 0.16 |
| -1.111999999999997 | 0.549 | 0.296 | 0.159 |
| -1.107999999999997 | 0.542 | 0.293 | 0.159 |
| -1.103999999999997 | 0.535 | 0.291 | 0.158 |
| -1.099999999999997 | 0.528 | 0.288 | 0.158 |
| -1.095999999999997 | 0.521 | 0.286 | 0.157 |
| -1.091999999999997 | 0.515 | 0.283 | 0.156 |
| -1.087999999999997 | 0.508 | 0.281 | 0.155 |
| -1.083999999999997 | 0.501 | 0.278 | 0.155 |
| -1.079999999999997 | 0.494 | 0.276 | 0.154 |
| -1.075999999999997 | 0.488 | 0.273 | 0.153 |
| -1.071999999999997 | 0.481 | 0.271 | 0.152 |
| -1.067999999999997 | 0.474 | 0.268 | 0.152 |
| -1.063999999999997 | 0.468 | 0.266 | 0.151 |
| -1.059999999999997 | 0.461 | 0.263 | 0.15 |
| -1.055999999999997 | 0.455 | 0.26 | 0.149 |
| -1.051999999999997 | 0.448 | 0.258 | 0.148 |
| -1.047999999999997 | 0.442 | 0.255 | 0.147 |
| -1.043999999999997 | 0.435 | 0.252 | 0.146 |
| -1.039999999999997 | 0.429 | 0.25 | 0.145 |
| -1.035999999999997 | 0.423 | 0.247 | 0.145 |
| -1.031999999999997 | 0.416 | 0.244 | 0.144 |
| -1.027999999999997 | 0.41 | 0.242 | 0.143 |
| -1.023999999999997 | 0.404 | 0.239 | 0.142 |
| -1.019999999999997 | 0.398 | 0.237 | 0.141 |
| -1.015999999999997 | 0.392 | 0.234 | 0.14 |
| -1.011999999999997 | 0.386 | 0.231 | 0.139 |
| -1.007999999999997 | 0.38 | 0.228 | 0.137 |
| -1.003999999999997 | 0.374 | 0.226 | 0.136 |
| -0.999999999999997 | 0.368 | 0.223 | 0.135 |
| -0.995999999999997 | 0.362 | 0.22 | 0.134 |
| -0.991999999999997 | 0.356 | 0.218 | 0.133 |
| -0.987999999999997 | 0.35 | 0.215 | 0.132 |
| -0.983999999999997 | 0.345 | 0.212 | 0.131 |
| -0.979999999999997 | 0.339 | 0.21 | 0.13 |
| -0.975999999999997 | 0.333 | 0.207 | 0.129 |
| -0.971999999999997 | 0.328 | 0.204 | 0.127 |
| -0.967999999999997 | 0.322 | 0.202 | 0.126 |
| -0.963999999999997 | 0.317 | 0.199 | 0.125 |
| -0.959999999999997 | 0.311 | 0.196 | 0.124 |
| -0.955999999999997 | 0.306 | 0.194 | 0.123 |
| -0.951999999999997 | 0.301 | 0.191 | 0.122 |
| -0.947999999999997 | 0.295 | 0.189 | 0.12 |
| -0.943999999999997 | 0.29 | 0.186 | 0.119 |
| -0.939999999999997 | 0.285 | 0.183 | 0.118 |
| -0.935999999999997 | 0.28 | 0.181 | 0.117 |
| -0.931999999999997 | 0.275 | 0.178 | 0.115 |
| -0.927999999999997 | 0.27 | 0.175 | 0.114 |
| -0.923999999999997 | 0.265 | 0.173 | 0.113 |
| -0.919999999999997 | 0.26 | 0.17 | 0.112 |
| -0.915999999999997 | 0.255 | 0.168 | 0.11 |
| -0.911999999999997 | 0.25 | 0.165 | 0.109 |
| -0.907999999999997 | 0.246 | 0.163 | 0.108 |
| -0.903999999999997 | 0.241 | 0.16 | 0.106 |
| -0.899999999999997 | 0.236 | 0.158 | 0.105 |
| -0.895999999999997 | 0.232 | 0.155 | 0.104 |
| -0.891999999999997 | 0.227 | 0.153 | 0.103 |
| -0.887999999999997 | 0.223 | 0.15 | 0.101 |
| -0.883999999999997 | 0.218 | 0.148 | 0.1 |
| -0.879999999999997 | 0.214 | 0.145 | 0.099 |
| -0.875999999999997 | 0.21 | 0.143 | 0.097 |
| -0.871999999999997 | 0.206 | 0.141 | 0.096 |
| -0.867999999999997 | 0.201 | 0.138 | 0.095 |
| -0.863999999999997 | 0.197 | 0.136 | 0.093 |
| -0.859999999999997 | 0.193 | 0.133 | 0.092 |
| -0.855999999999997 | 0.189 | 0.131 | 0.091 |
| -0.851999999999997 | 0.185 | 0.129 | 0.09 |
| -0.847999999999997 | 0.181 | 0.126 | 0.088 |
| -0.843999999999997 | 0.177 | 0.124 | 0.087 |
| -0.839999999999997 | 0.173 | 0.122 | 0.086 |
| -0.835999999999997 | 0.17 | 0.12 | 0.084 |
| -0.831999999999997 | 0.166 | 0.117 | 0.083 |
| -0.827999999999997 | 0.162 | 0.115 | 0.082 |
| -0.823999999999997 | 0.159 | 0.113 | 0.081 |
| -0.819999999999997 | 0.155 | 0.111 | 0.079 |
| -0.815999999999997 | 0.152 | 0.109 | 0.078 |
| -0.811999999999997 | 0.148 | 0.107 | 0.077 |
| -0.807999999999997 | 0.145 | 0.105 | 0.075 |
| -0.803999999999997 | 0.142 | 0.102 | 0.074 |
| -0.799999999999997 | 0.138 | 0.1 | 0.073 |
| -0.795999999999997 | 0.135 | 0.098 | 0.072 |
| -0.791999999999997 | 0.132 | 0.096 | 0.07 |
| -0.787999999999997 | 0.129 | 0.094 | 0.069 |
| -0.783999999999997 | 0.126 | 0.092 | 0.068 |
| -0.779999999999997 | 0.123 | 0.09 | 0.067 |
| -0.775999999999997 | 0.12 | 0.088 | 0.065 |
| -0.771999999999997 | 0.117 | 0.087 | 0.064 |
| -0.767999999999997 | 0.114 | 0.085 | 0.063 |
| -0.763999999999997 | 0.111 | 0.083 | 0.062 |
| -0.759999999999997 | 0.108 | 0.081 | 0.061 |
| -0.755999999999997 | 0.105 | 0.079 | 0.06 |
| -0.751999999999997 | 0.103 | 0.077 | 0.058 |
| -0.747999999999997 | 0.1 | 0.076 | 0.057 |
| -0.743999999999997 | 0.098 | 0.074 | 0.056 |
| -0.739999999999997 | 0.095 | 0.072 | 0.055 |
| -0.735999999999997 | 0.092 | 0.071 | 0.054 |
| -0.731999999999997 | 0.09 | 0.069 | 0.053 |
| -0.727999999999997 | 0.088 | 0.067 | 0.052 |
| -0.723999999999997 | 0.085 | 0.066 | 0.05 |
| -0.719999999999997 | 0.083 | 0.064 | 0.049 |
| -0.715999999999997 | 0.081 | 0.062 | 0.048 |
| -0.711999999999997 | 0.078 | 0.061 | 0.047 |
| -0.707999999999997 | 0.076 | 0.059 | 0.046 |
| -0.703999999999997 | 0.074 | 0.058 | 0.045 |
| -0.699999999999997 | 0.072 | 0.056 | 0.044 |
| -0.695999999999997 | 0.07 | 0.055 | 0.043 |
| -0.691999999999997 | 0.068 | 0.054 | 0.042 |
| -0.687999999999997 | 0.066 | 0.052 | 0.041 |
| -0.683999999999997 | 0.064 | 0.051 | 0.04 |
| -0.679999999999997 | 0.062 | 0.049 | 0.039 |
| -0.675999999999997 | 0.06 | 0.048 | 0.038 |
| -0.671999999999997 | 0.059 | 0.047 | 0.037 |
| -0.667999999999997 | 0.057 | 0.045 | 0.036 |
| -0.663999999999997 | 0.055 | 0.044 | 0.035 |
| -0.659999999999997 | 0.053 | 0.043 | 0.035 |
| -0.655999999999997 | 0.052 | 0.042 | 0.034 |
| -0.651999999999997 | 0.05 | 0.041 | 0.033 |
| -0.647999999999997 | 0.049 | 0.039 | 0.032 |
| -0.643999999999997 | 0.047 | 0.038 | 0.031 |
| -0.639999999999997 | 0.046 | 0.037 | 0.03 |
| -0.635999999999997 | 0.044 | 0.036 | 0.029 |
| -0.631999999999997 | 0.043 | 0.035 | 0.029 |
| -0.627999999999997 | 0.041 | 0.034 | 0.028 |
| -0.623999999999997 | 0.04 | 0.033 | 0.027 |
| -0.619999999999997 | 0.039 | 0.032 | 0.026 |
| -0.615999999999997 | 0.037 | 0.031 | 0.026 |
| -0.611999999999997 | 0.036 | 0.03 | 0.025 |
| -0.607999999999997 | 0.035 | 0.029 | 0.024 |
| -0.603999999999997 | 0.034 | 0.028 | 0.023 |
| -0.599999999999997 | 0.033 | 0.027 | 0.023 |
| -0.595999999999997 | 0.031 | 0.026 | 0.022 |
| -0.591999999999997 | 0.03 | 0.025 | 0.021 |
| -0.587999999999997 | 0.029 | 0.025 | 0.021 |
| -0.583999999999997 | 0.028 | 0.024 | 0.02 |
| -0.579999999999997 | 0.027 | 0.023 | 0.019 |
| -0.575999999999997 | 0.026 | 0.022 | 0.019 |
| -0.571999999999997 | 0.025 | 0.021 | 0.018 |
| -0.567999999999997 | 0.024 | 0.021 | 0.018 |
| -0.563999999999997 | 0.023 | 0.02 | 0.017 |
| -0.559999999999997 | 0.023 | 0.019 | 0.016 |
| -0.555999999999997 | 0.022 | 0.019 | 0.016 |
| -0.551999999999997 | 0.021 | 0.018 | 0.015 |
| -0.547999999999997 | 0.02 | 0.017 | 0.015 |
| -0.543999999999997 | 0.019 | 0.017 | 0.014 |
| -0.539999999999997 | 0.019 | 0.016 | 0.014 |
| -0.535999999999997 | 0.018 | 0.015 | 0.013 |
| -0.531999999999997 | 0.017 | 0.015 | 0.013 |
| -0.527999999999997 | 0.016 | 0.014 | 0.012 |
| -0.523999999999997 | 0.016 | 0.014 | 0.012 |
| -0.519999999999997 | 0.015 | 0.013 | 0.012 |
| -0.515999999999997 | 0.014 | 0.013 | 0.011 |
| -0.511999999999997 | 0.014 | 0.012 | 0.011 |
| -0.507999999999997 | 0.013 | 0.012 | 0.01 |
| -0.503999999999997 | 0.013 | 0.011 | 0.01 |
| -0.499999999999997 | 0.012 | 0.011 | 0.009 |
| -0.495999999999997 | 0.012 | 0.01 | 0.009 |
| -0.491999999999997 | 0.011 | 0.01 | 0.009 |
| -0.487999999999997 | 0.011 | 0.009 | 0.008 |
| -0.483999999999997 | 0.01 | 0.009 | 0.008 |
| -0.479999999999997 | 0.01 | 0.009 | 0.008 |
| -0.475999999999997 | 0.009 | 0.008 | 0.007 |
| -0.471999999999997 | 0.009 | 0.008 | 0.007 |
| -0.467999999999997 | 0.008 | 0.008 | 0.007 |
| -0.463999999999997 | 0.008 | 0.007 | 0.006 |
| -0.459999999999997 | 0.008 | 0.007 | 0.006 |
| -0.455999999999997 | 0.007 | 0.007 | 0.006 |
| -0.451999999999997 | 0.007 | 0.006 | 0.006 |
| -0.447999999999997 | 0.007 | 0.006 | 0.005 |
| -0.443999999999997 | 0.006 | 0.006 | 0.005 |
| -0.439999999999997 | 0.006 | 0.005 | 0.005 |
| -0.435999999999997 | 0.006 | 0.005 | 0.005 |
| -0.431999999999997 | 0.005 | 0.005 | 0.004 |
| -0.427999999999997 | 0.005 | 0.005 | 0.004 |
| -0.423999999999997 | 0.005 | 0.004 | 0.004 |
| -0.419999999999997 | 0.005 | 0.004 | 0.004 |
| -0.415999999999997 | 0.004 | 0.004 | 0.004 |
| -0.411999999999997 | 0.004 | 0.004 | 0.003 |
| -0.407999999999997 | 0.004 | 0.004 | 0.003 |
| -0.403999999999997 | 0.004 | 0.003 | 0.003 |
| -0.399999999999997 | 0.003 | 0.003 | 0.003 |
| -0.395999999999997 | 0.003 | 0.003 | 0.003 |
| -0.391999999999997 | 0.003 | 0.003 | 0.003 |
| -0.387999999999997 | 0.003 | 0.003 | 0.003 |
| -0.383999999999997 | 0.003 | 0.003 | 0.002 |
| -0.379999999999997 | 0.003 | 0.002 | 0.002 |
| -0.375999999999997 | 0.002 | 0.002 | 0.002 |
| -0.371999999999997 | 0.002 | 0.002 | 0.002 |
| -0.367999999999997 | 0.002 | 0.002 | 0.002 |
| -0.363999999999997 | 0.002 | 0.002 | 0.002 |
| -0.359999999999997 | 0.002 | 0.002 | 0.002 |
| -0.355999999999997 | 0.002 | 0.002 | 0.002 |
| -0.351999999999997 | 0.002 | 0.002 | 0.001 |
| -0.347999999999997 | 0.002 | 0.001 | 0.001 |
| -0.343999999999997 | 0.001 | 0.001 | 0.001 |
| -0.339999999999997 | 0.001 | 0.001 | 0.001 |
| -0.335999999999997 | 0.001 | 0.001 | 0.001 |
| -0.331999999999997 | 0.001 | 0.001 | 0.001 |
| -0.327999999999997 | 0.001 | 0.001 | 0.001 |
| -0.323999999999997 | 0.001 | 0.001 | 0.001 |
| -0.319999999999997 | 0.001 | 0.001 | 0.001 |
| -0.315999999999997 | 0.001 | 0.001 | 0.001 |
| -0.311999999999997 | 0.001 | 0.001 | 0.001 |
| -0.307999999999997 | 0.001 | 0.001 | 0.001 |
| -0.303999999999997 | 0.001 | 0.001 | 0.001 |
| -0.299999999999997 | 0.001 | 0.001 | 0.001 |
| -0.295999999999997 | 0.001 | 0.001 | 0.001 |
| -0.291999999999997 | 0.001 | 0.001 | 0.001 |
| -0.287999999999997 | 0.001 | 0.001 | 0 |
| -0.283999999999997 | 0 | 0 | 0 |
| -0.279999999999997 | 0 | 0 | 0 |
| -0.275999999999997 | 0 | 0 | 0 |
| -0.271999999999997 | 0 | 0 | 0 |
| -0.267999999999997 | 0 | 0 | 0 |
| -0.263999999999997 | 0 | 0 | 0 |
| -0.259999999999997 | 0 | 0 | 0 |
| -0.255999999999997 | 0 | 0 | 0 |
| -0.251999999999997 | 0 | 0 | 0 |
| -0.247999999999997 | 0 | 0 | 0 |
| -0.243999999999997 | 0 | 0 | 0 |
| -0.239999999999997 | 0 | 0 | 0 |
| -0.235999999999997 | 0 | 0 | 0 |
| -0.231999999999997 | 0 | 0 | 0 |
| -0.227999999999997 | 0 | 0 | 0 |
| -0.223999999999997 | 0 | 0 | 0 |
| -0.219999999999997 | 0 | 0 | 0 |
| -0.215999999999997 | 0 | 0 | 0 |
| -0.211999999999997 | 0 | 0 | 0 |
| -0.207999999999997 | 0 | 0 | 0 |
| -0.203999999999997 | 0 | 0 | 0 |
| -0.199999999999997 | 0 | 0 | 0 |
| -0.195999999999997 | 0 | 0 | 0 |
| -0.191999999999997 | 0 | 0 | 0 |
| -0.187999999999997 | 0 | 0 | 0 |
| -0.183999999999997 | 0 | 0 | 0 |
| -0.179999999999997 | 0 | 0 | 0 |
| -0.175999999999997 | 0 | 0 | 0 |
| -0.171999999999997 | 0 | 0 | 0 |
| -0.167999999999997 | 0 | 0 | 0 |
| -0.163999999999997 | 0 | 0 | 0 |
| -0.159999999999997 | 0 | 0 | 0 |
| -0.155999999999997 | 0 | 0 | 0 |
| -0.151999999999997 | 0 | 0 | 0 |
| -0.147999999999997 | 0 | 0 | 0 |
| -0.143999999999997 | 0 | 0 | 0 |
| -0.139999999999997 | 0 | 0 | 0 |
| -0.135999999999997 | 0 | 0 | 0 |
| -0.131999999999997 | 0 | 0 | 0 |
| -0.127999999999997 | 0 | 0 | 0 |
| -0.123999999999997 | 0 | 0 | 0 |
| -0.119999999999997 | 0 | 0 | 0 |
| -0.115999999999997 | 0 | 0 | 0 |
| -0.111999999999997 | 0 | 0 | 0 |
| -0.107999999999997 | 0 | 0 | 0 |
| -0.103999999999997 | 0 | 0 | 0 |
| -0.0999999999999965 | 0 | 0 | 0 |
| -0.0959999999999965 | 0 | 0 | 0 |
| -0.0919999999999965 | 0 | 0 | 0 |
| -0.0879999999999965 | 0 | 0 | 0 |
| -0.0839999999999965 | 0 | 0 | 0 |
| -0.0799999999999965 | 0 | 0 | 0 |
| -0.0759999999999965 | 0 | 0 | 0 |
| -0.0719999999999965 | 0 | 0 | 0 |
| -0.0679999999999965 | 0 | 0 | 0 |
| -0.0639999999999965 | 0 | 0 | 0 |
| -0.0599999999999965 | 0 | 0 | 0 |
| -0.0559999999999965 | 0 | 0 | 0 |
| -0.0519999999999965 | 0 | 0 | 0 |
| -0.0479999999999965 | 0 | 0 | 0 |
| -0.0439999999999965 | 0 | 0 | 0 |
| -0.0399999999999965 | 0 | 0 | 0 |
| -0.0359999999999965 | 0 | 0 | 0 |
| -0.0319999999999965 | 0 | 0 | 0 |
| -0.0279999999999965 | 0 | 0 | 0 |
| -0.0239999999999965 | 0 | 0 | 0 |
| -0.0199999999999965 | 0 | 0 | 0 |
| -0.0159999999999965 | 0 | 0 | 0 |
| -0.0119999999999965 | 0 | 0 | 0 |
| -0.00799999999999647 | 0 | 0 | 0 |
| -0.00399999999999647 | 0 | 0 | 0 |
| 3.52495810318487e-15 | 0 | 0 | 0 |
| 0.00400000000000352 | 0 | 0 | 0 |
| 0.00800000000000352 | 0 | 0 | 0 |
| 0.0120000000000035 | 0 | 0 | 0 |
| 0.0160000000000035 | 0 | 0 | 0 |
| 0.0200000000000035 | 0 | 0 | 0 |
| 0.0240000000000035 | 0 | 0 | 0 |
| 0.0280000000000035 | 0 | 0 | 0 |
| 0.0320000000000035 | 0 | 0 | 0 |
| 0.0360000000000035 | 0 | 0 | 0 |
| 0.0400000000000035 | 0 | 0 | 0 |
| 0.0440000000000035 | 0 | 0 | 0 |
| 0.0480000000000035 | 0 | 0 | 0 |
| 0.0520000000000035 | 0 | 0 | 0 |
| 0.0560000000000035 | 0 | 0 | 0 |
| 0.0600000000000035 | 0 | 0 | 0 |
| 0.0640000000000035 | 0 | 0 | 0 |
| 0.0680000000000035 | 0 | 0 | 0 |
| 0.0720000000000036 | 0 | 0 | 0 |
| 0.0760000000000036 | 0 | 0 | 0 |
| 0.0800000000000036 | 0 | 0 | 0 |
| 0.0840000000000036 | 0 | 0 | 0 |
| 0.0880000000000036 | 0 | 0 | 0 |
| 0.0920000000000036 | 0 | 0 | 0 |
| 0.0960000000000036 | 0 | 0 | 0 |
| 0.100000000000004 | 0 | 0 | 0 |
| 0.104000000000004 | 0 | 0 | 0 |
| 0.108000000000004 | 0 | 0 | 0 |
| 0.112000000000004 | 0 | 0 | 0 |
| 0.116000000000004 | 0 | 0 | 0 |
| 0.120000000000004 | 0 | 0 | 0 |
| 0.124000000000004 | 0 | 0 | 0 |
| 0.128000000000004 | 0 | 0 | 0 |
| 0.132000000000004 | 0 | 0 | 0 |
| 0.136000000000004 | 0 | 0 | 0 |
| 0.140000000000004 | 0 | 0 | 0 |
| 0.144000000000004 | 0 | 0 | 0 |
| 0.148000000000004 | 0 | 0 | 0 |
| 0.152000000000004 | 0 | 0 | 0 |
| 0.156000000000004 | 0 | 0 | 0 |
| 0.160000000000004 | 0 | 0 | 0 |
| 0.164000000000004 | 0 | 0 | 0 |
| 0.168000000000004 | 0 | 0 | 0 |
| 0.172000000000004 | 0 | 0 | 0 |
| 0.176000000000004 | 0 | 0 | 0 |
| 0.180000000000004 | 0 | 0 | 0 |
| 0.184000000000004 | 0 | 0 | 0 |
| 0.188000000000004 | 0 | 0 | 0 |
| 0.192000000000004 | 0 | 0 | 0 |
| 0.196000000000004 | 0 | 0 | 0 |
| 0.200000000000004 | 0 | 0 | 0 |
| 0.204000000000004 | 0 | 0 | 0 |
| 0.208000000000004 | 0 | 0 | 0 |
| 0.212000000000004 | 0 | 0 | 0 |
| 0.216000000000004 | 0 | 0 | 0 |
| 0.220000000000004 | 0 | 0 | 0 |
| 0.224000000000004 | 0 | 0 | 0 |
| 0.228000000000004 | 0 | 0 | 0 |
| 0.232000000000004 | 0 | 0 | 0 |
| 0.236000000000004 | 0 | 0 | 0 |
| 0.240000000000004 | 0 | 0 | 0 |
| 0.244000000000004 | 0 | 0 | 0 |
| 0.248000000000004 | 0 | 0 | 0 |
| 0.252000000000004 | 0 | 0 | 0 |
| 0.256000000000004 | 0 | 0 | 0 |
| 0.260000000000004 | 0 | 0 | 0 |
| 0.264000000000004 | 0 | 0 | 0 |
| 0.268000000000004 | 0 | 0 | 0 |
| 0.272000000000004 | 0 | 0 | 0 |
| 0.276000000000004 | 0 | 0 | 0 |
| 0.280000000000004 | 0 | 0 | 0 |
| 0.284000000000004 | 0 | 0 | 0 |
| 0.288000000000004 | 0.001 | 0.001 | 0 |
| 0.292000000000004 | 0.001 | 0.001 | 0.001 |
| 0.296000000000004 | 0.001 | 0.001 | 0.001 |
| 0.300000000000004 | 0.001 | 0.001 | 0.001 |
| 0.304000000000004 | 0.001 | 0.001 | 0.001 |
| 0.308000000000004 | 0.001 | 0.001 | 0.001 |
| 0.312000000000004 | 0.001 | 0.001 | 0.001 |
| 0.316000000000004 | 0.001 | 0.001 | 0.001 |
| 0.320000000000004 | 0.001 | 0.001 | 0.001 |
| 0.324000000000004 | 0.001 | 0.001 | 0.001 |
| 0.328000000000004 | 0.001 | 0.001 | 0.001 |
| 0.332000000000004 | 0.001 | 0.001 | 0.001 |
| 0.336000000000004 | 0.001 | 0.001 | 0.001 |
| 0.340000000000004 | 0.001 | 0.001 | 0.001 |
| 0.344000000000004 | 0.001 | 0.001 | 0.001 |
| 0.348000000000004 | 0.002 | 0.001 | 0.001 |
| 0.352000000000004 | 0.002 | 0.002 | 0.001 |
| 0.356000000000004 | 0.002 | 0.002 | 0.002 |
| 0.360000000000004 | 0.002 | 0.002 | 0.002 |
| 0.364000000000004 | 0.002 | 0.002 | 0.002 |
| 0.368000000000004 | 0.002 | 0.002 | 0.002 |
| 0.372000000000004 | 0.002 | 0.002 | 0.002 |
| 0.376000000000004 | 0.002 | 0.002 | 0.002 |
| 0.380000000000004 | 0.003 | 0.002 | 0.002 |
| 0.384000000000004 | 0.003 | 0.003 | 0.002 |
| 0.388000000000004 | 0.003 | 0.003 | 0.003 |
| 0.392000000000004 | 0.003 | 0.003 | 0.003 |
| 0.396000000000004 | 0.003 | 0.003 | 0.003 |
| 0.400000000000004 | 0.003 | 0.003 | 0.003 |
| 0.404000000000004 | 0.004 | 0.003 | 0.003 |
| 0.408000000000004 | 0.004 | 0.004 | 0.003 |
| 0.412000000000004 | 0.004 | 0.004 | 0.003 |
| 0.416000000000004 | 0.004 | 0.004 | 0.004 |
| 0.420000000000004 | 0.005 | 0.004 | 0.004 |
| 0.424000000000004 | 0.005 | 0.004 | 0.004 |
| 0.428000000000004 | 0.005 | 0.005 | 0.004 |
| 0.432000000000004 | 0.005 | 0.005 | 0.004 |
| 0.436000000000004 | 0.006 | 0.005 | 0.005 |
| 0.440000000000004 | 0.006 | 0.005 | 0.005 |
| 0.444000000000004 | 0.006 | 0.006 | 0.005 |
| 0.448000000000004 | 0.007 | 0.006 | 0.005 |
| 0.452000000000004 | 0.007 | 0.006 | 0.006 |
| 0.456000000000004 | 0.007 | 0.007 | 0.006 |
| 0.460000000000004 | 0.008 | 0.007 | 0.006 |
| 0.464000000000004 | 0.008 | 0.007 | 0.006 |
| 0.468000000000004 | 0.008 | 0.008 | 0.007 |
| 0.472000000000004 | 0.009 | 0.008 | 0.007 |
| 0.476000000000004 | 0.009 | 0.008 | 0.007 |
| 0.480000000000004 | 0.01 | 0.009 | 0.008 |
| 0.484000000000004 | 0.01 | 0.009 | 0.008 |
| 0.488000000000004 | 0.011 | 0.009 | 0.008 |
| 0.492000000000004 | 0.011 | 0.01 | 0.009 |
| 0.496000000000004 | 0.012 | 0.01 | 0.009 |
| 0.500000000000004 | 0.012 | 0.011 | 0.009 |
| 0.504000000000004 | 0.013 | 0.011 | 0.01 |
| 0.508000000000004 | 0.013 | 0.012 | 0.01 |
| 0.512000000000004 | 0.014 | 0.012 | 0.011 |
| 0.516000000000004 | 0.014 | 0.013 | 0.011 |
| 0.520000000000004 | 0.015 | 0.013 | 0.012 |
| 0.524000000000004 | 0.016 | 0.014 | 0.012 |
| 0.528000000000004 | 0.016 | 0.014 | 0.012 |
| 0.532000000000004 | 0.017 | 0.015 | 0.013 |
| 0.536000000000004 | 0.018 | 0.015 | 0.013 |
| 0.540000000000004 | 0.019 | 0.016 | 0.014 |
| 0.544000000000004 | 0.019 | 0.017 | 0.014 |
| 0.548000000000004 | 0.02 | 0.017 | 0.015 |
| 0.552000000000004 | 0.021 | 0.018 | 0.015 |
| 0.556000000000004 | 0.022 | 0.019 | 0.016 |
| 0.560000000000004 | 0.023 | 0.019 | 0.016 |
| 0.564000000000004 | 0.023 | 0.02 | 0.017 |
| 0.568000000000004 | 0.024 | 0.021 | 0.018 |
| 0.572000000000004 | 0.025 | 0.021 | 0.018 |
| 0.576000000000004 | 0.026 | 0.022 | 0.019 |
| 0.580000000000004 | 0.027 | 0.023 | 0.019 |
| 0.584000000000004 | 0.028 | 0.024 | 0.02 |
| 0.588000000000004 | 0.029 | 0.025 | 0.021 |
| 0.592000000000004 | 0.03 | 0.025 | 0.021 |
| 0.596000000000004 | 0.031 | 0.026 | 0.022 |
| 0.600000000000004 | 0.033 | 0.027 | 0.023 |
| 0.604000000000004 | 0.034 | 0.028 | 0.023 |
| 0.608000000000004 | 0.035 | 0.029 | 0.024 |
| 0.612000000000004 | 0.036 | 0.03 | 0.025 |
| 0.616000000000004 | 0.037 | 0.031 | 0.026 |
| 0.620000000000004 | 0.039 | 0.032 | 0.026 |
| 0.624000000000004 | 0.04 | 0.033 | 0.027 |
| 0.628000000000004 | 0.041 | 0.034 | 0.028 |
| 0.632000000000004 | 0.043 | 0.035 | 0.029 |
| 0.636000000000004 | 0.044 | 0.036 | 0.029 |
| 0.640000000000004 | 0.046 | 0.037 | 0.03 |
| 0.644000000000004 | 0.047 | 0.038 | 0.031 |
| 0.648000000000004 | 0.049 | 0.039 | 0.032 |
| 0.652000000000004 | 0.05 | 0.041 | 0.033 |
| 0.656000000000004 | 0.052 | 0.042 | 0.034 |
| 0.660000000000004 | 0.053 | 0.043 | 0.035 |
| 0.664000000000004 | 0.055 | 0.044 | 0.035 |
| 0.668000000000004 | 0.057 | 0.045 | 0.036 |
| 0.672000000000004 | 0.059 | 0.047 | 0.037 |
| 0.676000000000004 | 0.06 | 0.048 | 0.038 |
| 0.680000000000004 | 0.062 | 0.049 | 0.039 |
| 0.684000000000004 | 0.064 | 0.051 | 0.04 |
| 0.688000000000004 | 0.066 | 0.052 | 0.041 |
| 0.692000000000004 | 0.068 | 0.054 | 0.042 |
| 0.696000000000004 | 0.07 | 0.055 | 0.043 |
| 0.700000000000004 | 0.072 | 0.056 | 0.044 |
| 0.704000000000004 | 0.074 | 0.058 | 0.045 |
| 0.708000000000004 | 0.076 | 0.059 | 0.046 |
| 0.712000000000004 | 0.078 | 0.061 | 0.047 |
| 0.716000000000004 | 0.081 | 0.062 | 0.048 |
| 0.720000000000004 | 0.083 | 0.064 | 0.049 |
| 0.724000000000004 | 0.085 | 0.066 | 0.05 |
| 0.728000000000004 | 0.088 | 0.067 | 0.052 |
| 0.732000000000004 | 0.09 | 0.069 | 0.053 |
| 0.736000000000004 | 0.092 | 0.071 | 0.054 |
| 0.740000000000004 | 0.095 | 0.072 | 0.055 |
| 0.744000000000004 | 0.098 | 0.074 | 0.056 |
| 0.748000000000004 | 0.1 | 0.076 | 0.057 |
| 0.752000000000004 | 0.103 | 0.077 | 0.058 |
| 0.756000000000004 | 0.105 | 0.079 | 0.06 |
| 0.760000000000004 | 0.108 | 0.081 | 0.061 |
| 0.764000000000004 | 0.111 | 0.083 | 0.062 |
| 0.768000000000004 | 0.114 | 0.085 | 0.063 |
| 0.772000000000004 | 0.117 | 0.087 | 0.064 |
| 0.776000000000004 | 0.12 | 0.088 | 0.065 |
| 0.780000000000004 | 0.123 | 0.09 | 0.067 |
| 0.784000000000004 | 0.126 | 0.092 | 0.068 |
| 0.788000000000004 | 0.129 | 0.094 | 0.069 |
| 0.792000000000004 | 0.132 | 0.096 | 0.07 |
| 0.796000000000004 | 0.135 | 0.098 | 0.072 |
| 0.800000000000004 | 0.138 | 0.1 | 0.073 |
| 0.804000000000004 | 0.142 | 0.102 | 0.074 |
| 0.808000000000004 | 0.145 | 0.105 | 0.075 |
| 0.812000000000004 | 0.148 | 0.107 | 0.077 |
| 0.816000000000004 | 0.152 | 0.109 | 0.078 |
| 0.820000000000004 | 0.155 | 0.111 | 0.079 |
| 0.824000000000004 | 0.159 | 0.113 | 0.081 |
| 0.828000000000004 | 0.162 | 0.115 | 0.082 |
| 0.832000000000004 | 0.166 | 0.117 | 0.083 |
| 0.836000000000004 | 0.17 | 0.12 | 0.084 |
| 0.840000000000004 | 0.173 | 0.122 | 0.086 |
| 0.844000000000004 | 0.177 | 0.124 | 0.087 |
| 0.848000000000004 | 0.181 | 0.126 | 0.088 |
| 0.852000000000004 | 0.185 | 0.129 | 0.09 |
| 0.856000000000004 | 0.189 | 0.131 | 0.091 |
| 0.860000000000004 | 0.193 | 0.133 | 0.092 |
| 0.864000000000004 | 0.197 | 0.136 | 0.093 |
| 0.868000000000004 | 0.201 | 0.138 | 0.095 |
| 0.872000000000004 | 0.206 | 0.141 | 0.096 |
| 0.876000000000004 | 0.21 | 0.143 | 0.097 |
| 0.880000000000004 | 0.214 | 0.145 | 0.099 |
| 0.884000000000004 | 0.218 | 0.148 | 0.1 |
| 0.888000000000004 | 0.223 | 0.15 | 0.101 |
| 0.892000000000004 | 0.227 | 0.153 | 0.103 |
| 0.896000000000004 | 0.232 | 0.155 | 0.104 |
| 0.900000000000004 | 0.236 | 0.158 | 0.105 |
| 0.904000000000004 | 0.241 | 0.16 | 0.106 |
| 0.908000000000004 | 0.246 | 0.163 | 0.108 |
| 0.912000000000004 | 0.25 | 0.165 | 0.109 |
| 0.916000000000004 | 0.255 | 0.168 | 0.11 |
| 0.920000000000004 | 0.26 | 0.17 | 0.112 |
| 0.924000000000004 | 0.265 | 0.173 | 0.113 |
| 0.928000000000004 | 0.27 | 0.175 | 0.114 |
| 0.932000000000004 | 0.275 | 0.178 | 0.115 |
| 0.936000000000004 | 0.28 | 0.181 | 0.117 |
| 0.940000000000004 | 0.285 | 0.183 | 0.118 |
| 0.944000000000004 | 0.29 | 0.186 | 0.119 |
| 0.948000000000004 | 0.295 | 0.189 | 0.12 |
| 0.952000000000004 | 0.301 | 0.191 | 0.122 |
| 0.956000000000004 | 0.306 | 0.194 | 0.123 |
| 0.960000000000004 | 0.311 | 0.196 | 0.124 |
| 0.964000000000004 | 0.317 | 0.199 | 0.125 |
| 0.968000000000004 | 0.322 | 0.202 | 0.126 |
| 0.972000000000004 | 0.328 | 0.204 | 0.127 |
| 0.976000000000004 | 0.333 | 0.207 | 0.129 |
| 0.980000000000004 | 0.339 | 0.21 | 0.13 |
| 0.984000000000004 | 0.345 | 0.212 | 0.131 |
| 0.988000000000004 | 0.35 | 0.215 | 0.132 |
| 0.992000000000004 | 0.356 | 0.218 | 0.133 |
| 0.996000000000004 | 0.362 | 0.22 | 0.134 |
| 1.000000000000004 | 0.368 | 0.223 | 0.135 |
| 1.004000000000004 | 0.374 | 0.226 | 0.136 |
| 1.008000000000004 | 0.38 | 0.228 | 0.137 |
| 1.012000000000004 | 0.386 | 0.231 | 0.139 |
| 1.016000000000004 | 0.392 | 0.234 | 0.14 |
| 1.020000000000004 | 0.398 | 0.237 | 0.141 |
| 1.024000000000004 | 0.404 | 0.239 | 0.142 |
| 1.028000000000004 | 0.41 | 0.242 | 0.143 |
| 1.032000000000004 | 0.416 | 0.244 | 0.144 |
| 1.036000000000004 | 0.423 | 0.247 | 0.145 |
| 1.040000000000004 | 0.429 | 0.25 | 0.145 |
| 1.044000000000004 | 0.435 | 0.252 | 0.146 |
| 1.048000000000004 | 0.442 | 0.255 | 0.147 |
| 1.052000000000004 | 0.448 | 0.258 | 0.148 |
| 1.056000000000004 | 0.455 | 0.26 | 0.149 |
| 1.060000000000004 | 0.461 | 0.263 | 0.15 |
| 1.064000000000004 | 0.468 | 0.266 | 0.151 |
| 1.068000000000004 | 0.474 | 0.268 | 0.152 |
| 1.072000000000004 | 0.481 | 0.271 | 0.152 |
| 1.076000000000004 | 0.488 | 0.273 | 0.153 |
| 1.080000000000004 | 0.494 | 0.276 | 0.154 |
| 1.084000000000004 | 0.501 | 0.278 | 0.155 |
| 1.088000000000004 | 0.508 | 0.281 | 0.155 |
| 1.092000000000004 | 0.515 | 0.283 | 0.156 |
| 1.096000000000004 | 0.521 | 0.286 | 0.157 |
| 1.100000000000004 | 0.528 | 0.288 | 0.158 |
| 1.104000000000004 | 0.535 | 0.291 | 0.158 |
| 1.108000000000004 | 0.542 | 0.293 | 0.159 |
| 1.112000000000004 | 0.549 | 0.296 | 0.159 |
| 1.116000000000004 | 0.556 | 0.298 | 0.16 |
| 1.120000000000004 | 0.563 | 0.301 | 0.161 |
| 1.124000000000004 | 0.57 | 0.303 | 0.161 |
| 1.128000000000004 | 0.577 | 0.305 | 0.162 |
| 1.132000000000004 | 0.584 | 0.308 | 0.162 |
| 1.136000000000004 | 0.591 | 0.31 | 0.163 |
| 1.140000000000004 | 0.598 | 0.312 | 0.163 |
| 1.144000000000004 | 0.606 | 0.315 | 0.164 |
| 1.148000000000004 | 0.613 | 0.317 | 0.164 |
| 1.152000000000004 | 0.62 | 0.319 | 0.164 |
| 1.156000000000004 | 0.627 | 0.322 | 0.165 |
| 1.160000000000004 | 0.634 | 0.324 | 0.165 |
| 1.164000000000004 | 0.642 | 0.326 | 0.166 |
| 1.168000000000004 | 0.649 | 0.328 | 0.166 |
| 1.172000000000004 | 0.656 | 0.33 | 0.166 |
| 1.176000000000004 | 0.663 | 0.332 | 0.166 |
| 1.180000000000004 | 0.671 | 0.334 | 0.167 |
| 1.184000000000004 | 0.678 | 0.336 | 0.167 |
| 1.188000000000004 | 0.685 | 0.338 | 0.167 |
| 1.192000000000004 | 0.693 | 0.34 | 0.167 |
| 1.196000000000004 | 0.7 | 0.342 | 0.167 |
| 1.200000000000004 | 0.707 | 0.344 | 0.168 |
| 1.204000000000004 | 0.715 | 0.346 | 0.168 |
| 1.208000000000004 | 0.722 | 0.348 | 0.168 |
| 1.212000000000004 | 0.73 | 0.35 | 0.168 |
| 1.216000000000004 | 0.737 | 0.352 | 0.168 |
| 1.220000000000004 | 0.744 | 0.354 | 0.168 |
| 1.224000000000004 | 0.752 | 0.355 | 0.168 |
| 1.228000000000004 | 0.759 | 0.357 | 0.168 |
| 1.232000000000004 | 0.766 | 0.359 | 0.168 |
| 1.236000000000004 | 0.774 | 0.361 | 0.168 |
| 1.240000000000004 | 0.781 | 0.362 | 0.168 |
| 1.244000000000004 | 0.789 | 0.364 | 0.168 |
| 1.248000000000004 | 0.796 | 0.365 | 0.168 |
| 1.252000000000004 | 0.803 | 0.367 | 0.168 |
| 1.256000000000004 | 0.811 | 0.368 | 0.167 |
| 1.260000000000004 | 0.818 | 0.37 | 0.167 |
| 1.264000000000004 | 0.825 | 0.371 | 0.167 |
| 1.268000000000004 | 0.833 | 0.373 | 0.167 |
| 1.272000000000004 | 0.84 | 0.374 | 0.167 |
| 1.276000000000004 | 0.847 | 0.375 | 0.166 |
| 1.280000000000004 | 0.854 | 0.377 | 0.166 |
| 1.284000000000004 | 0.862 | 0.378 | 0.166 |
| 1.288000000000004 | 0.869 | 0.379 | 0.165 |
| 1.292000000000004 | 0.876 | 0.38 | 0.165 |
| 1.296000000000004 | 0.883 | 0.381 | 0.165 |
| 1.300000000000004 | 0.891 | 0.383 | 0.164 |
| 1.304000000000004 | 0.898 | 0.384 | 0.164 |
| 1.308000000000004 | 0.905 | 0.385 | 0.164 |
| 1.312000000000004 | 0.912 | 0.386 | 0.163 |
| 1.316000000000004 | 0.919 | 0.387 | 0.163 |
| 1.320000000000004 | 0.926 | 0.388 | 0.162 |
| 1.324000000000004 | 0.933 | 0.388 | 0.162 |
| 1.328000000000004 | 0.94 | 0.389 | 0.161 |
| 1.332000000000004 | 0.947 | 0.39 | 0.161 |
| 1.336000000000004 | 0.954 | 0.391 | 0.16 |
| 1.340000000000004 | 0.961 | 0.392 | 0.16 |
| 1.344000000000004 | 0.968 | 0.392 | 0.159 |
| 1.348000000000004 | 0.975 | 0.393 | 0.158 |
| 1.352000000000004 | 0.982 | 0.394 | 0.158 |
| 1.356000000000004 | 0.989 | 0.394 | 0.157 |
| 1.360000000000004 | 0.995 | 0.395 | 0.157 |
| 1.364000000000004 | 1.002 | 0.395 | 0.156 |
| 1.368000000000004 | 1.009 | 0.396 | 0.155 |
| 1.372000000000004 | 1.015 | 0.396 | 0.155 |
| 1.376000000000004 | 1.022 | 0.397 | 0.154 |
| 1.380000000000004 | 1.028 | 0.397 | 0.153 |
| 1.384000000000004 | 1.035 | 0.397 | 0.152 |
| 1.388000000000005 | 1.041 | 0.397 | 0.152 |
| 1.392000000000004 | 1.048 | 0.398 | 0.151 |
| 1.396000000000004 | 1.054 | 0.398 | 0.15 |
| 1.400000000000005 | 1.061 | 0.398 | 0.149 |
| 1.404000000000005 | 1.067 | 0.398 | 0.149 |
| 1.408000000000005 | 1.073 | 0.398 | 0.148 |
| 1.412000000000005 | 1.079 | 0.398 | 0.147 |
| 1.416000000000005 | 1.085 | 0.398 | 0.146 |
| 1.420000000000005 | 1.091 | 0.398 | 0.145 |
| 1.424000000000005 | 1.098 | 0.398 | 0.144 |
| 1.428000000000005 | 1.103 | 0.398 | 0.144 |
| 1.432000000000005 | 1.109 | 0.398 | 0.143 |
| 1.436000000000005 | 1.115 | 0.398 | 0.142 |
| 1.440000000000005 | 1.121 | 0.398 | 0.141 |
| 1.444000000000005 | 1.127 | 0.397 | 0.14 |
| 1.448000000000005 | 1.132 | 0.397 | 0.139 |
| 1.452000000000005 | 1.138 | 0.397 | 0.138 |
| 1.456000000000005 | 1.144 | 0.396 | 0.137 |
| 1.460000000000005 | 1.149 | 0.396 | 0.136 |
| 1.464000000000005 | 1.155 | 0.395 | 0.135 |
| 1.468000000000005 | 1.16 | 0.395 | 0.134 |
| 1.472000000000005 | 1.165 | 0.394 | 0.133 |
| 1.476000000000005 | 1.171 | 0.394 | 0.133 |
| 1.480000000000005 | 1.176 | 0.393 | 0.132 |
| 1.484000000000005 | 1.181 | 0.393 | 0.131 |
| 1.488000000000005 | 1.186 | 0.392 | 0.13 |
| 1.492000000000005 | 1.191 | 0.391 | 0.129 |
| 1.496000000000005 | 1.196 | 0.391 | 0.128 |
| 1.500000000000005 | 1.201 | 0.39 | 0.127 |
| 1.504000000000005 | 1.205 | 0.389 | 0.126 |
| 1.508000000000005 | 1.21 | 0.388 | 0.125 |
| 1.512000000000005 | 1.215 | 0.387 | 0.123 |
| 1.516000000000005 | 1.219 | 0.386 | 0.122 |
| 1.520000000000005 | 1.224 | 0.385 | 0.121 |
| 1.524000000000005 | 1.228 | 0.384 | 0.12 |
| 1.528000000000005 | 1.232 | 0.383 | 0.119 |
| 1.532000000000005 | 1.237 | 0.382 | 0.118 |
| 1.536000000000005 | 1.241 | 0.381 | 0.117 |
| 1.540000000000005 | 1.245 | 0.38 | 0.116 |
| 1.544000000000005 | 1.249 | 0.379 | 0.115 |
| 1.548000000000005 | 1.253 | 0.378 | 0.114 |
| 1.552000000000005 | 1.257 | 0.377 | 0.113 |
| 1.556000000000005 | 1.261 | 0.376 | 0.112 |
| 1.560000000000005 | 1.264 | 0.374 | 0.111 |
| 1.564000000000005 | 1.268 | 0.373 | 0.11 |
| 1.568000000000005 | 1.271 | 0.372 | 0.109 |
| 1.572000000000005 | 1.275 | 0.371 | 0.108 |
| 1.576000000000005 | 1.278 | 0.369 | 0.107 |
| 1.580000000000005 | 1.282 | 0.368 | 0.106 |
| 1.584000000000005 | 1.285 | 0.366 | 0.105 |
| 1.588000000000005 | 1.288 | 0.365 | 0.103 |
| 1.592000000000005 | 1.291 | 0.364 | 0.102 |
| 1.596000000000005 | 1.294 | 0.362 | 0.101 |
| 1.600000000000005 | 1.297 | 0.361 | 0.1 |
| 1.604000000000005 | 1.3 | 0.359 | 0.099 |
| 1.608000000000005 | 1.302 | 0.358 | 0.098 |
| 1.612000000000005 | 1.305 | 0.356 | 0.097 |
| 1.616000000000005 | 1.308 | 0.354 | 0.096 |
| 1.620000000000005 | 1.31 | 0.353 | 0.095 |
| 1.624000000000005 | 1.313 | 0.351 | 0.094 |
| 1.628000000000005 | 1.315 | 0.349 | 0.093 |
| 1.632000000000005 | 1.317 | 0.348 | 0.092 |
| 1.636000000000005 | 1.319 | 0.346 | 0.091 |
| 1.640000000000005 | 1.321 | 0.344 | 0.09 |
| 1.644000000000005 | 1.323 | 0.343 | 0.089 |
| 1.648000000000005 | 1.325 | 0.341 | 0.088 |
| 1.652000000000005 | 1.327 | 0.339 | 0.087 |
| 1.656000000000005 | 1.329 | 0.337 | 0.086 |
| 1.660000000000005 | 1.33 | 0.335 | 0.085 |
| 1.664000000000005 | 1.332 | 0.334 | 0.084 |
| 1.668000000000005 | 1.333 | 0.332 | 0.083 |
| 1.672000000000005 | 1.334 | 0.33 | 0.082 |
| 1.676000000000005 | 1.336 | 0.328 | 0.081 |
| 1.680000000000005 | 1.337 | 0.326 | 0.079 |
| 1.684000000000005 | 1.338 | 0.324 | 0.078 |
| 1.688000000000005 | 1.339 | 0.322 | 0.078 |
| 1.692000000000005 | 1.34 | 0.32 | 0.077 |
| 1.696000000000005 | 1.341 | 0.318 | 0.076 |
| 1.700000000000005 | 1.341 | 0.316 | 0.075 |
| 1.704000000000005 | 1.342 | 0.314 | 0.074 |
| 1.708000000000005 | 1.343 | 0.312 | 0.073 |
| 1.712000000000005 | 1.343 | 0.31 | 0.072 |
| 1.716000000000005 | 1.344 | 0.308 | 0.071 |
| 1.720000000000005 | 1.344 | 0.306 | 0.07 |
| 1.724000000000005 | 1.344 | 0.304 | 0.069 |
| 1.728000000000005 | 1.344 | 0.302 | 0.068 |
| 1.732000000000005 | 1.344 | 0.3 | 0.067 |
| 1.736000000000005 | 1.344 | 0.298 | 0.066 |
| 1.740000000000005 | 1.344 | 0.296 | 0.065 |
| 1.744000000000005 | 1.344 | 0.294 | 0.064 |
| 1.748000000000005 | 1.344 | 0.292 | 0.063 |
| 1.752000000000005 | 1.343 | 0.289 | 0.062 |
| 1.756000000000005 | 1.343 | 0.287 | 0.061 |
| 1.760000000000005 | 1.342 | 0.285 | 0.061 |
| 1.764000000000005 | 1.342 | 0.283 | 0.06 |
| 1.768000000000005 | 1.341 | 0.281 | 0.059 |
| 1.772000000000005 | 1.34 | 0.279 | 0.058 |
| 1.776000000000005 | 1.339 | 0.277 | 0.057 |
| 1.780000000000005 | 1.338 | 0.274 | 0.056 |
| 1.784000000000005 | 1.337 | 0.272 | 0.055 |
| 1.788000000000005 | 1.336 | 0.27 | 0.055 |
| 1.792000000000005 | 1.335 | 0.268 | 0.054 |
| 1.796000000000005 | 1.333 | 0.266 | 0.053 |
| 1.800000000000005 | 1.332 | 0.264 | 0.052 |
| 1.804000000000005 | 1.331 | 0.261 | 0.051 |
| 1.808000000000005 | 1.329 | 0.259 | 0.051 |
| 1.812000000000005 | 1.327 | 0.257 | 0.05 |
| 1.816000000000005 | 1.326 | 0.255 | 0.049 |
| 1.820000000000005 | 1.324 | 0.253 | 0.048 |
| 1.824000000000005 | 1.322 | 0.251 | 0.047 |
| 1.828000000000005 | 1.32 | 0.248 | 0.047 |
| 1.832000000000005 | 1.318 | 0.246 | 0.046 |
| 1.836000000000005 | 1.316 | 0.244 | 0.045 |
| 1.840000000000005 | 1.314 | 0.242 | 0.044 |
| 1.844000000000005 | 1.312 | 0.24 | 0.044 |
| 1.848000000000005 | 1.309 | 0.237 | 0.043 |
| 1.852000000000005 | 1.307 | 0.235 | 0.042 |
| 1.856000000000005 | 1.304 | 0.233 | 0.042 |
| 1.860000000000005 | 1.302 | 0.231 | 0.041 |
| 1.864000000000005 | 1.299 | 0.229 | 0.04 |
| 1.868000000000005 | 1.297 | 0.227 | 0.04 |
| 1.872000000000005 | 1.294 | 0.224 | 0.039 |
| 1.876000000000005 | 1.291 | 0.222 | 0.038 |
| 1.880000000000005 | 1.288 | 0.22 | 0.038 |
| 1.884000000000005 | 1.285 | 0.218 | 0.037 |
| 1.888000000000005 | 1.282 | 0.216 | 0.036 |
| 1.892000000000005 | 1.279 | 0.214 | 0.036 |
| 1.896000000000005 | 1.276 | 0.211 | 0.035 |
| 1.900000000000005 | 1.273 | 0.209 | 0.034 |
| 1.904000000000005 | 1.269 | 0.207 | 0.034 |
| 1.908000000000005 | 1.266 | 0.205 | 0.033 |
| 1.912000000000005 | 1.263 | 0.203 | 0.033 |
| 1.916000000000005 | 1.259 | 0.201 | 0.032 |
| 1.920000000000005 | 1.256 | 0.199 | 0.031 |
| 1.924000000000005 | 1.252 | 0.197 | 0.031 |
| 1.928000000000005 | 1.248 | 0.195 | 0.03 |
| 1.932000000000005 | 1.244 | 0.193 | 0.03 |
| 1.936000000000005 | 1.241 | 0.19 | 0.029 |
| 1.940000000000005 | 1.237 | 0.188 | 0.029 |
| 1.944000000000005 | 1.233 | 0.186 | 0.028 |
| 1.948000000000005 | 1.229 | 0.184 | 0.028 |
| 1.952000000000005 | 1.225 | 0.182 | 0.027 |
| 1.956000000000005 | 1.221 | 0.18 | 0.027 |
| 1.960000000000005 | 1.217 | 0.178 | 0.026 |
| 1.964000000000005 | 1.212 | 0.176 | 0.026 |
| 1.968000000000005 | 1.208 | 0.174 | 0.025 |
| 1.972000000000005 | 1.204 | 0.172 | 0.025 |
| 1.976000000000005 | 1.199 | 0.17 | 0.024 |
| 1.980000000000005 | 1.195 | 0.168 | 0.024 |
| 1.984000000000005 | 1.191 | 0.166 | 0.023 |
| 1.988000000000005 | 1.186 | 0.164 | 0.023 |
| 1.992000000000005 | 1.181 | 0.162 | 0.022 |
| 1.996000000000005 | 1.177 | 0.161 | 0.022 |
| 2.000000000000005 | 1.172 | 0.159 | 0.021 |
| 2.004000000000005 | 1.167 | 0.157 | 0.021 |
| 2.008000000000005 | 1.163 | 0.155 | 0.021 |
| 2.012000000000005 | 1.158 | 0.153 | 0.02 |
| 2.016000000000005 | 1.153 | 0.151 | 0.02 |
| 2.020000000000005 | 1.148 | 0.149 | 0.019 |
| 2.024000000000005 | 1.143 | 0.147 | 0.019 |
| 2.028000000000005 | 1.138 | 0.146 | 0.019 |
| 2.032000000000005 | 1.133 | 0.144 | 0.018 |
| 2.036000000000005 | 1.128 | 0.142 | 0.018 |
| 2.040000000000005 | 1.123 | 0.14 | 0.018 |
| 2.044000000000005 | 1.118 | 0.138 | 0.017 |
| 2.048000000000005 | 1.113 | 0.137 | 0.017 |
| 2.052000000000005 | 1.108 | 0.135 | 0.016 |
| 2.056000000000005 | 1.102 | 0.133 | 0.016 |
| 2.060000000000005 | 1.097 | 0.131 | 0.016 |
| 2.064000000000005 | 1.092 | 0.13 | 0.015 |
| 2.068000000000005 | 1.086 | 0.128 | 0.015 |
| 2.072000000000005 | 1.081 | 0.126 | 0.015 |
| 2.076000000000005 | 1.076 | 0.125 | 0.014 |
| 2.080000000000005 | 1.07 | 0.123 | 0.014 |
| 2.084000000000005 | 1.065 | 0.121 | 0.014 |
| 2.088000000000005 | 1.059 | 0.12 | 0.014 |
| 2.092000000000005 | 1.054 | 0.118 | 0.013 |
| 2.096000000000005 | 1.048 | 0.117 | 0.013 |
| 2.100000000000005 | 1.043 | 0.115 | 0.013 |
| 2.104000000000005 | 1.037 | 0.113 | 0.012 |
| 2.108000000000005 | 1.031 | 0.112 | 0.012 |
| 2.112000000000005 | 1.026 | 0.11 | 0.012 |
| 2.116000000000005 | 1.02 | 0.109 | 0.012 |
| 2.120000000000005 | 1.014 | 0.107 | 0.011 |
| 2.124000000000005 | 1.008 | 0.106 | 0.011 |
| 2.128000000000005 | 1.003 | 0.104 | 0.011 |
| 2.132000000000005 | 0.997 | 0.103 | 0.011 |
| 2.136000000000005 | 0.991 | 0.101 | 0.01 |
| 2.140000000000005 | 0.985 | 0.1 | 0.01 |
| 2.144000000000005 | 0.98 | 0.098 | 0.01 |
| 2.148000000000005 | 0.974 | 0.097 | 0.01 |
| 2.152000000000005 | 0.968 | 0.096 | 0.009 |
| 2.156000000000005 | 0.962 | 0.094 | 0.009 |
| 2.160000000000005 | 0.956 | 0.093 | 0.009 |
| 2.164000000000005 | 0.95 | 0.091 | 0.009 |
| 2.168000000000005 | 0.944 | 0.09 | 0.009 |
| 2.172000000000005 | 0.938 | 0.089 | 0.008 |
| 2.176000000000005 | 0.932 | 0.087 | 0.008 |
| 2.180000000000005 | 0.926 | 0.086 | 0.008 |
| 2.184000000000005 | 0.92 | 0.085 | 0.008 |
| 2.188000000000005 | 0.914 | 0.083 | 0.008 |
| 2.192000000000005 | 0.908 | 0.082 | 0.007 |
| 2.196000000000005 | 0.902 | 0.081 | 0.007 |
| 2.200000000000005 | 0.897 | 0.08 | 0.007 |
| 2.204000000000005 | 0.89 | 0.078 | 0.007 |
| 2.208000000000005 | 0.884 | 0.077 | 0.007 |
| 2.212000000000005 | 0.878 | 0.076 | 0.007 |
| 2.216000000000005 | 0.872 | 0.075 | 0.006 |
| 2.220000000000005 | 0.866 | 0.074 | 0.006 |
| 2.224000000000005 | 0.86 | 0.073 | 0.006 |
| 2.228000000000005 | 0.854 | 0.071 | 0.006 |
| 2.232000000000005 | 0.848 | 0.07 | 0.006 |
| 2.236000000000005 | 0.842 | 0.069 | 0.006 |
| 2.240000000000005 | 0.836 | 0.068 | 0.006 |
| 2.244000000000005 | 0.83 | 0.067 | 0.005 |
| 2.248000000000005 | 0.824 | 0.066 | 0.005 |
| 2.252000000000005 | 0.818 | 0.065 | 0.005 |
| 2.256000000000005 | 0.812 | 0.064 | 0.005 |
| 2.260000000000005 | 0.806 | 0.063 | 0.005 |
| 2.264000000000005 | 0.8 | 0.062 | 0.005 |
| 2.268000000000005 | 0.794 | 0.061 | 0.005 |
| 2.272000000000005 | 0.788 | 0.06 | 0.005 |
| 2.276000000000005 | 0.782 | 0.059 | 0.004 |
| 2.280000000000005 | 0.776 | 0.058 | 0.004 |
| 2.284000000000005 | 0.77 | 0.057 | 0.004 |
| 2.288000000000005 | 0.764 | 0.056 | 0.004 |
| 2.292000000000005 | 0.758 | 0.055 | 0.004 |
| 2.296000000000005 | 0.752 | 0.054 | 0.004 |
| 2.300000000000005 | 0.746 | 0.053 | 0.004 |
| 2.304000000000005 | 0.74 | 0.052 | 0.004 |
| 2.308000000000005 | 0.734 | 0.051 | 0.004 |
| 2.312000000000005 | 0.729 | 0.05 | 0.003 |
| 2.316000000000005 | 0.723 | 0.049 | 0.003 |
| 2.320000000000005 | 0.717 | 0.049 | 0.003 |
| 2.324000000000005 | 0.711 | 0.048 | 0.003 |
| 2.328000000000005 | 0.705 | 0.047 | 0.003 |
| 2.332000000000005 | 0.699 | 0.046 | 0.003 |
| 2.336000000000005 | 0.693 | 0.045 | 0.003 |
| 2.340000000000005 | 0.687 | 0.044 | 0.003 |
| 2.344000000000005 | 0.682 | 0.044 | 0.003 |
| 2.348000000000005 | 0.676 | 0.043 | 0.003 |
| 2.352000000000005 | 0.67 | 0.042 | 0.003 |
| 2.356000000000005 | 0.664 | 0.041 | 0.003 |
| 2.360000000000005 | 0.659 | 0.041 | 0.003 |
| 2.364000000000005 | 0.653 | 0.04 | 0.002 |
| 2.368000000000005 | 0.647 | 0.039 | 0.002 |
| 2.372000000000005 | 0.641 | 0.038 | 0.002 |
| 2.376000000000005 | 0.636 | 0.038 | 0.002 |
| 2.380000000000005 | 0.63 | 0.037 | 0.002 |
| 2.384000000000005 | 0.625 | 0.036 | 0.002 |
| 2.388000000000005 | 0.619 | 0.036 | 0.002 |
| 2.392000000000005 | 0.613 | 0.035 | 0.002 |
| 2.396000000000005 | 0.608 | 0.034 | 0.002 |
| 2.400000000000005 | 0.602 | 0.034 | 0.002 |
| 2.404000000000005 | 0.597 | 0.033 | 0.002 |
| 2.408000000000005 | 0.591 | 0.033 | 0.002 |
| 2.412000000000005 | 0.586 | 0.032 | 0.002 |
| 2.416000000000005 | 0.58 | 0.031 | 0.002 |
| 2.420000000000005 | 0.575 | 0.031 | 0.002 |
| 2.424000000000005 | 0.569 | 0.03 | 0.002 |
| 2.428000000000005 | 0.564 | 0.03 | 0.002 |
| 2.432000000000005 | 0.559 | 0.029 | 0.002 |
| 2.436000000000005 | 0.553 | 0.028 | 0.001 |
| 2.440000000000005 | 0.548 | 0.028 | 0.001 |
| 2.444000000000005 | 0.543 | 0.027 | 0.001 |
| 2.448000000000005 | 0.537 | 0.027 | 0.001 |
| 2.452000000000005 | 0.532 | 0.026 | 0.001 |
| 2.456000000000005 | 0.527 | 0.026 | 0.001 |
| 2.460000000000005 | 0.522 | 0.025 | 0.001 |
| 2.464000000000005 | 0.517 | 0.025 | 0.001 |
| 2.468000000000005 | 0.511 | 0.024 | 0.001 |
| 2.472000000000005 | 0.506 | 0.024 | 0.001 |
| 2.476000000000005 | 0.501 | 0.023 | 0.001 |
| 2.480000000000005 | 0.496 | 0.023 | 0.001 |
| 2.484000000000005 | 0.491 | 0.022 | 0.001 |
| 2.488000000000005 | 0.486 | 0.022 | 0.001 |
| 2.492000000000005 | 0.481 | 0.022 | 0.001 |
| 2.496000000000005 | 0.476 | 0.021 | 0.001 |
| 2.500000000000005 | 0.471 | 0.021 | 0.001 |
| 2.504000000000005 | 0.466 | 0.02 | 0.001 |
| 2.508000000000005 | 0.462 | 0.02 | 0.001 |
| 2.512000000000005 | 0.457 | 0.019 | 0.001 |
| 2.516000000000005 | 0.452 | 0.019 | 0.001 |
| 2.520000000000005 | 0.447 | 0.019 | 0.001 |
| 2.524000000000005 | 0.442 | 0.018 | 0.001 |
| 2.528000000000005 | 0.438 | 0.018 | 0.001 |
| 2.532000000000005 | 0.433 | 0.018 | 0.001 |
| 2.536000000000005 | 0.428 | 0.017 | 0.001 |
| 2.540000000000005 | 0.424 | 0.017 | 0.001 |
| 2.544000000000005 | 0.419 | 0.016 | 0.001 |
| 2.548000000000005 | 0.415 | 0.016 | 0.001 |
| 2.552000000000005 | 0.41 | 0.016 | 0.001 |
| 2.556000000000005 | 0.406 | 0.015 | 0.001 |
| 2.560000000000005 | 0.401 | 0.015 | 0.001 |
| 2.564000000000005 | 0.397 | 0.015 | 0.001 |
| 2.568000000000005 | 0.392 | 0.015 | 0.001 |
| 2.572000000000005 | 0.388 | 0.014 | 0.001 |
| 2.576000000000005 | 0.384 | 0.014 | 0.001 |
| 2.580000000000005 | 0.379 | 0.014 | 0 |
| 2.584000000000005 | 0.375 | 0.013 | 0 |
| 2.588000000000005 | 0.371 | 0.013 | 0 |
| 2.592000000000005 | 0.366 | 0.013 | 0 |
| 2.596000000000005 | 0.362 | 0.012 | 0 |
| 2.600000000000005 | 0.358 | 0.012 | 0 |
| 2.604000000000005 | 0.354 | 0.012 | 0 |
| 2.608000000000005 | 0.35 | 0.012 | 0 |
| 2.612000000000005 | 0.346 | 0.011 | 0 |
| 2.616000000000005 | 0.342 | 0.011 | 0 |
| 2.620000000000005 | 0.338 | 0.011 | 0 |
| 2.624000000000005 | 0.334 | 0.011 | 0 |
| 2.628000000000005 | 0.33 | 0.01 | 0 |
| 2.632000000000005 | 0.326 | 0.01 | 0 |
| 2.636000000000005 | 0.322 | 0.01 | 0 |
| 2.640000000000005 | 0.318 | 0.01 | 0 |
| 2.644000000000005 | 0.314 | 0.01 | 0 |
| 2.648000000000005 | 0.311 | 0.009 | 0 |
| 2.652000000000005 | 0.307 | 0.009 | 0 |
| 2.656000000000005 | 0.303 | 0.009 | 0 |
| 2.660000000000005 | 0.299 | 0.009 | 0 |
| 2.664000000000005 | 0.296 | 0.009 | 0 |
| 2.668000000000005 | 0.292 | 0.008 | 0 |
| 2.672000000000005 | 0.289 | 0.008 | 0 |
| 2.676000000000005 | 0.285 | 0.008 | 0 |
| 2.680000000000005 | 0.282 | 0.008 | 0 |
| 2.684000000000005 | 0.278 | 0.008 | 0 |
| 2.688000000000005 | 0.275 | 0.007 | 0 |
| 2.692000000000005 | 0.271 | 0.007 | 0 |
| 2.696000000000005 | 0.268 | 0.007 | 0 |
| 2.700000000000005 | 0.264 | 0.007 | 0 |
| 2.704000000000005 | 0.261 | 0.007 | 0 |
| 2.708000000000005 | 0.258 | 0.007 | 0 |
| 2.712000000000005 | 0.254 | 0.006 | 0 |
| 2.716000000000005 | 0.251 | 0.006 | 0 |
| 2.720000000000005 | 0.248 | 0.006 | 0 |
| 2.724000000000005 | 0.245 | 0.006 | 0 |
| 2.728000000000005 | 0.242 | 0.006 | 0 |
| 2.732000000000005 | 0.238 | 0.006 | 0 |
| 2.736000000000005 | 0.235 | 0.006 | 0 |
| 2.740000000000005 | 0.232 | 0.005 | 0 |
| 2.744000000000005 | 0.229 | 0.005 | 0 |
| 2.748000000000005 | 0.226 | 0.005 | 0 |
| 2.752000000000005 | 0.223 | 0.005 | 0 |
| 2.756000000000005 | 0.22 | 0.005 | 0 |
| 2.760000000000005 | 0.217 | 0.005 | 0 |
| 2.764000000000005 | 0.214 | 0.005 | 0 |
| 2.768000000000005 | 0.212 | 0.005 | 0 |
| 2.772000000000005 | 0.209 | 0.004 | 0 |
| 2.776000000000005 | 0.206 | 0.004 | 0 |
| 2.780000000000005 | 0.203 | 0.004 | 0 |
| 2.784000000000005 | 0.2 | 0.004 | 0 |
| 2.788000000000006 | 0.198 | 0.004 | 0 |
| 2.792000000000005 | 0.195 | 0.004 | 0 |
| 2.796000000000005 | 0.192 | 0.004 | 0 |
| 2.800000000000006 | 0.19 | 0.004 | 0 |
| 2.804000000000006 | 0.187 | 0.004 | 0 |
| 2.808000000000006 | 0.185 | 0.004 | 0 |
| 2.812000000000006 | 0.182 | 0.003 | 0 |
| 2.816000000000006 | 0.179 | 0.003 | 0 |
| 2.820000000000006 | 0.177 | 0.003 | 0 |
| 2.824000000000006 | 0.174 | 0.003 | 0 |
| 2.828000000000006 | 0.172 | 0.003 | 0 |
| 2.832000000000006 | 0.17 | 0.003 | 0 |
| 2.836000000000006 | 0.167 | 0.003 | 0 |
| 2.840000000000006 | 0.165 | 0.003 | 0 |
| 2.844000000000006 | 0.163 | 0.003 | 0 |
| 2.848000000000006 | 0.16 | 0.003 | 0 |
| 2.852000000000006 | 0.158 | 0.003 | 0 |
| 2.856000000000006 | 0.156 | 0.003 | 0 |
| 2.860000000000006 | 0.153 | 0.003 | 0 |
| 2.864000000000006 | 0.151 | 0.003 | 0 |
| 2.868000000000006 | 0.149 | 0.002 | 0 |
| 2.872000000000006 | 0.147 | 0.002 | 0 |
| 2.876000000000006 | 0.145 | 0.002 | 0 |
| 2.880000000000006 | 0.143 | 0.002 | 0 |
| 2.884000000000006 | 0.141 | 0.002 | 0 |
| 2.888000000000006 | 0.138 | 0.002 | 0 |
| 2.892000000000006 | 0.136 | 0.002 | 0 |
| 2.896000000000006 | 0.134 | 0.002 | 0 |
| 2.900000000000006 | 0.132 | 0.002 | 0 |
| 2.904000000000006 | 0.13 | 0.002 | 0 |
| 2.908000000000006 | 0.129 | 0.002 | 0 |
| 2.912000000000006 | 0.127 | 0.002 | 0 |
| 2.916000000000006 | 0.125 | 0.002 | 0 |
| 2.920000000000006 | 0.123 | 0.002 | 0 |
| 2.924000000000006 | 0.121 | 0.002 | 0 |
| 2.928000000000006 | 0.119 | 0.002 | 0 |
| 2.932000000000006 | 0.117 | 0.002 | 0 |
| 2.936000000000006 | 0.116 | 0.002 | 0 |
| 2.940000000000006 | 0.114 | 0.002 | 0 |
| 2.944000000000006 | 0.112 | 0.001 | 0 |
| 2.948000000000006 | 0.11 | 0.001 | 0 |
| 2.952000000000006 | 0.109 | 0.001 | 0 |
| 2.956000000000006 | 0.107 | 0.001 | 0 |
| 2.960000000000006 | 0.105 | 0.001 | 0 |
| 2.964000000000006 | 0.104 | 0.001 | 0 |
| 2.968000000000006 | 0.102 | 0.001 | 0 |
| 2.972000000000006 | 0.101 | 0.001 | 0 |
| 2.976000000000006 | 0.099 | 0.001 | 0 |
| 2.980000000000006 | 0.097 | 0.001 | 0 |
| 2.984000000000006 | 0.096 | 0.001 | 0 |
| 2.988000000000006 | 0.094 | 0.001 | 0 |
| 2.992000000000006 | 0.093 | 0.001 | 0 |
| 2.996000000000006 | 0.091 | 0.001 | 0 |
| 3.000000000000006 | 0.09 | 0.001 | 0 |
| 3.004000000000006 | 0.089 | 0.001 | 0 |
| 3.008000000000006 | 0.087 | 0.001 | 0 |
| 3.012000000000006 | 0.086 | 0.001 | 0 |
| 3.016000000000006 | 0.084 | 0.001 | 0 |
| 3.020000000000006 | 0.083 | 0.001 | 0 |
| 3.024000000000006 | 0.082 | 0.001 | 0 |
| 3.028000000000006 | 0.08 | 0.001 | 0 |
| 3.032000000000006 | 0.079 | 0.001 | 0 |
| 3.036000000000006 | 0.078 | 0.001 | 0 |
| 3.040000000000006 | 0.077 | 0.001 | 0 |
| 3.044000000000006 | 0.075 | 0.001 | 0 |
| 3.048000000000006 | 0.074 | 0.001 | 0 |
| 3.052000000000006 | 0.073 | 0.001 | 0 |
| 3.056000000000006 | 0.072 | 0.001 | 0 |
| 3.060000000000006 | 0.07 | 0.001 | 0 |
| 3.064000000000006 | 0.069 | 0.001 | 0 |
| 3.068000000000006 | 0.068 | 0.001 | 0 |
| 3.072000000000006 | 0.067 | 0.001 | 0 |
| 3.076000000000006 | 0.066 | 0.001 | 0 |
| 3.080000000000006 | 0.065 | 0.001 | 0 |
| 3.084000000000006 | 0.064 | 0.001 | 0 |
| 3.088000000000006 | 0.063 | 0.001 | 0 |
| 3.092000000000006 | 0.062 | 0.001 | 0 |
| 3.096000000000006 | 0.061 | 0.001 | 0 |
| 3.100000000000006 | 0.06 | 0 | 0 |
| 3.104000000000006 | 0.059 | 0 | 0 |
| 3.108000000000006 | 0.058 | 0 | 0 |
| 3.112000000000006 | 0.057 | 0 | 0 |
| 3.116000000000006 | 0.056 | 0 | 0 |
| 3.120000000000006 | 0.055 | 0 | 0 |
| 3.124000000000006 | 0.054 | 0 | 0 |
| 3.128000000000006 | 0.053 | 0 | 0 |
| 3.132000000000006 | 0.052 | 0 | 0 |
| 3.136000000000006 | 0.051 | 0 | 0 |
| 3.140000000000006 | 0.05 | 0 | 0 |
| 3.144000000000006 | 0.049 | 0 | 0 |
| 3.148000000000006 | 0.048 | 0 | 0 |
| 3.152000000000006 | 0.048 | 0 | 0 |
| 3.156000000000006 | 0.047 | 0 | 0 |
| 3.160000000000006 | 0.046 | 0 | 0 |
| 3.164000000000006 | 0.045 | 0 | 0 |
| 3.168000000000006 | 0.044 | 0 | 0 |
| 3.172000000000006 | 0.043 | 0 | 0 |
| 3.176000000000006 | 0.043 | 0 | 0 |
| 3.180000000000006 | 0.042 | 0 | 0 |
| 3.184000000000006 | 0.041 | 0 | 0 |
| 3.188000000000006 | 0.04 | 0 | 0 |
| 3.192000000000006 | 0.04 | 0 | 0 |
| 3.196000000000006 | 0.039 | 0 | 0 |
| 3.200000000000006 | 0.038 | 0 | 0 |
| 3.204000000000006 | 0.038 | 0 | 0 |
| 3.208000000000006 | 0.037 | 0 | 0 |
| 3.212000000000006 | 0.036 | 0 | 0 |
| 3.216000000000006 | 0.036 | 0 | 0 |
| 3.220000000000006 | 0.035 | 0 | 0 |
| 3.224000000000006 | 0.034 | 0 | 0 |
| 3.228000000000006 | 0.034 | 0 | 0 |
| 3.232000000000006 | 0.033 | 0 | 0 |
| 3.236000000000006 | 0.033 | 0 | 0 |
| 3.240000000000006 | 0.032 | 0 | 0 |
| 3.244000000000006 | 0.031 | 0 | 0 |
| 3.248000000000006 | 0.031 | 0 | 0 |
| 3.252000000000006 | 0.03 | 0 | 0 |
| 3.256000000000006 | 0.03 | 0 | 0 |
| 3.260000000000006 | 0.029 | 0 | 0 |
| 3.264000000000006 | 0.029 | 0 | 0 |
| 3.268000000000006 | 0.028 | 0 | 0 |
| 3.272000000000006 | 0.027 | 0 | 0 |
| 3.276000000000006 | 0.027 | 0 | 0 |
| 3.280000000000006 | 0.026 | 0 | 0 |
| 3.284000000000006 | 0.026 | 0 | 0 |
| 3.288000000000006 | 0.025 | 0 | 0 |
| 3.292000000000006 | 0.025 | 0 | 0 |
| 3.296000000000006 | 0.025 | 0 | 0 |
| 3.300000000000006 | 0.024 | 0 | 0 |
| 3.304000000000006 | 0.024 | 0 | 0 |
| 3.308000000000006 | 0.023 | 0 | 0 |
| 3.312000000000006 | 0.023 | 0 | 0 |
| 3.316000000000006 | 0.022 | 0 | 0 |
| 3.320000000000006 | 0.022 | 0 | 0 |
| 3.324000000000006 | 0.021 | 0 | 0 |
| 3.328000000000006 | 0.021 | 0 | 0 |
| 3.332000000000006 | 0.021 | 0 | 0 |
| 3.336000000000006 | 0.02 | 0 | 0 |
| 3.340000000000006 | 0.02 | 0 | 0 |
| 3.344000000000006 | 0.019 | 0 | 0 |
| 3.348000000000006 | 0.019 | 0 | 0 |
| 3.352000000000006 | 0.019 | 0 | 0 |
| 3.356000000000006 | 0.018 | 0 | 0 |
| 3.360000000000006 | 0.018 | 0 | 0 |
| 3.364000000000006 | 0.018 | 0 | 0 |
| 3.368000000000006 | 0.017 | 0 | 0 |
| 3.372000000000006 | 0.017 | 0 | 0 |
| 3.376000000000006 | 0.017 | 0 | 0 |
| 3.380000000000006 | 0.016 | 0 | 0 |
| 3.384000000000006 | 0.016 | 0 | 0 |
| 3.388000000000006 | 0.016 | 0 | 0 |
| 3.392000000000006 | 0.015 | 0 | 0 |
| 3.396000000000006 | 0.015 | 0 | 0 |
| 3.400000000000006 | 0.015 | 0 | 0 |
| 3.404000000000006 | 0.014 | 0 | 0 |
| 3.408000000000006 | 0.014 | 0 | 0 |
| 3.412000000000006 | 0.014 | 0 | 0 |
| 3.416000000000006 | 0.014 | 0 | 0 |
| 3.420000000000006 | 0.013 | 0 | 0 |
| 3.424000000000006 | 0.013 | 0 | 0 |
| 3.428000000000006 | 0.013 | 0 | 0 |
| 3.432000000000006 | 0.013 | 0 | 0 |
| 3.436000000000006 | 0.012 | 0 | 0 |
| 3.440000000000006 | 0.012 | 0 | 0 |
| 3.444000000000006 | 0.012 | 0 | 0 |
| 3.448000000000006 | 0.012 | 0 | 0 |
| 3.452000000000006 | 0.011 | 0 | 0 |
| 3.456000000000006 | 0.011 | 0 | 0 |
| 3.460000000000006 | 0.011 | 0 | 0 |
| 3.464000000000006 | 0.011 | 0 | 0 |
| 3.468000000000006 | 0.01 | 0 | 0 |
| 3.472000000000006 | 0.01 | 0 | 0 |
| 3.476000000000006 | 0.01 | 0 | 0 |
| 3.480000000000006 | 0.01 | 0 | 0 |
| 3.484000000000006 | 0.01 | 0 | 0 |
| 3.488000000000006 | 0.009 | 0 | 0 |
| 3.492000000000006 | 0.009 | 0 | 0 |
| 3.496000000000006 | 0.009 | 0 | 0 |
| 3.500000000000006 | 0.009 | 0 | 0 |
| 3.504000000000006 | 0.009 | 0 | 0 |
| 3.508000000000006 | 0.008 | 0 | 0 |
| 3.512000000000006 | 0.008 | 0 | 0 |
| 3.516000000000006 | 0.008 | 0 | 0 |
| 3.520000000000006 | 0.008 | 0 | 0 |
| 3.524000000000006 | 0.008 | 0 | 0 |
| 3.528000000000006 | 0.008 | 0 | 0 |
| 3.532000000000006 | 0.007 | 0 | 0 |
| 3.536000000000006 | 0.007 | 0 | 0 |
| 3.540000000000006 | 0.007 | 0 | 0 |
| 3.544000000000006 | 0.007 | 0 | 0 |
| 3.548000000000006 | 0.007 | 0 | 0 |
| 3.552000000000006 | 0.007 | 0 | 0 |
| 3.556000000000006 | 0.007 | 0 | 0 |
| 3.560000000000006 | 0.006 | 0 | 0 |
| 3.564000000000006 | 0.006 | 0 | 0 |
| 3.568000000000006 | 0.006 | 0 | 0 |
| 3.572000000000006 | 0.006 | 0 | 0 |
| 3.576000000000006 | 0.006 | 0 | 0 |
| 3.580000000000006 | 0.006 | 0 | 0 |
| 3.584000000000006 | 0.006 | 0 | 0 |
| 3.588000000000006 | 0.005 | 0 | 0 |
| 3.592000000000006 | 0.005 | 0 | 0 |
| 3.596000000000006 | 0.005 | 0 | 0 |
| 3.600000000000006 | 0.005 | 0 | 0 |
| 3.604000000000006 | 0.005 | 0 | 0 |
| 3.608000000000006 | 0.005 | 0 | 0 |
| 3.612000000000006 | 0.005 | 0 | 0 |
| 3.616000000000006 | 0.005 | 0 | 0 |
| 3.620000000000006 | 0.005 | 0 | 0 |
| 3.624000000000006 | 0.004 | 0 | 0 |
| 3.628000000000006 | 0.004 | 0 | 0 |
| 3.632000000000006 | 0.004 | 0 | 0 |
| 3.636000000000006 | 0.004 | 0 | 0 |
| 3.640000000000006 | 0.004 | 0 | 0 |
| 3.644000000000006 | 0.004 | 0 | 0 |
| 3.648000000000006 | 0.004 | 0 | 0 |
| 3.652000000000006 | 0.004 | 0 | 0 |
| 3.656000000000006 | 0.004 | 0 | 0 |
| 3.660000000000006 | 0.004 | 0 | 0 |
| 3.664000000000006 | 0.004 | 0 | 0 |
| 3.668000000000006 | 0.003 | 0 | 0 |
| 3.672000000000006 | 0.003 | 0 | 0 |
| 3.676000000000006 | 0.003 | 0 | 0 |
| 3.680000000000006 | 0.003 | 0 | 0 |
| 3.684000000000006 | 0.003 | 0 | 0 |
| 3.688000000000006 | 0.003 | 0 | 0 |
| 3.692000000000006 | 0.003 | 0 | 0 |
| 3.696000000000006 | 0.003 | 0 | 0 |
| 3.700000000000006 | 0.003 | 0 | 0 |
| 3.704000000000006 | 0.003 | 0 | 0 |
| 3.708000000000006 | 0.003 | 0 | 0 |
| 3.712000000000006 | 0.003 | 0 | 0 |
| 3.716000000000006 | 0.003 | 0 | 0 |
| 3.720000000000006 | 0.003 | 0 | 0 |
| 3.724000000000006 | 0.003 | 0 | 0 |
| 3.728000000000006 | 0.002 | 0 | 0 |
| 3.732000000000006 | 0.002 | 0 | 0 |
| 3.736000000000006 | 0.002 | 0 | 0 |
| 3.740000000000006 | 0.002 | 0 | 0 |
| 3.744000000000006 | 0.002 | 0 | 0 |
| 3.748000000000006 | 0.002 | 0 | 0 |
| 3.752000000000006 | 0.002 | 0 | 0 |
| 3.756000000000006 | 0.002 | 0 | 0 |
| 3.760000000000006 | 0.002 | 0 | 0 |
| 3.764000000000006 | 0.002 | 0 | 0 |
| 3.768000000000006 | 0.002 | 0 | 0 |
| 3.772000000000006 | 0.002 | 0 | 0 |
| 3.776000000000006 | 0.002 | 0 | 0 |
| 3.780000000000006 | 0.002 | 0 | 0 |
| 3.784000000000006 | 0.002 | 0 | 0 |
| 3.788000000000006 | 0.002 | 0 | 0 |
| 3.792000000000006 | 0.002 | 0 | 0 |
| 3.796000000000006 | 0.002 | 0 | 0 |
| 3.800000000000006 | 0.002 | 0 | 0 |
| 3.804000000000006 | 0.002 | 0 | 0 |
| 3.808000000000006 | 0.002 | 0 | 0 |
| 3.812000000000006 | 0.001 | 0 | 0 |
| 3.816000000000006 | 0.001 | 0 | 0 |
| 3.820000000000006 | 0.001 | 0 | 0 |
| 3.824000000000006 | 0.001 | 0 | 0 |
| 3.828000000000006 | 0.001 | 0 | 0 |
| 3.832000000000006 | 0.001 | 0 | 0 |
| 3.836000000000006 | 0.001 | 0 | 0 |
| 3.840000000000006 | 0.001 | 0 | 0 |
| 3.844000000000006 | 0.001 | 0 | 0 |
| 3.848000000000006 | 0.001 | 0 | 0 |
| 3.852000000000006 | 0.001 | 0 | 0 |
| 3.856000000000006 | 0.001 | 0 | 0 |
| 3.860000000000006 | 0.001 | 0 | 0 |
| 3.864000000000006 | 0.001 | 0 | 0 |
| 3.868000000000006 | 0.001 | 0 | 0 |
| 3.872000000000006 | 0.001 | 0 | 0 |
| 3.876000000000006 | 0.001 | 0 | 0 |
| 3.880000000000006 | 0.001 | 0 | 0 |
| 3.884000000000006 | 0.001 | 0 | 0 |
| 3.888000000000007 | 0.001 | 0 | 0 |
| 3.892000000000006 | 0.001 | 0 | 0 |
| 3.896000000000006 | 0.001 | 0 | 0 |
| 3.900000000000007 | 0.001 | 0 | 0 |
| 3.904000000000007 | 0.001 | 0 | 0 |
| 3.908000000000007 | 0.001 | 0 | 0 |
| 3.912000000000007 | 0.001 | 0 | 0 |
| 3.916000000000007 | 0.001 | 0 | 0 |
| 3.920000000000007 | 0.001 | 0 | 0 |
| 3.924000000000007 | 0.001 | 0 | 0 |
| 3.928000000000007 | 0.001 | 0 | 0 |
| 3.932000000000007 | 0.001 | 0 | 0 |
| 3.936000000000007 | 0.001 | 0 | 0 |
| 3.940000000000007 | 0.001 | 0 | 0 |
| 3.944000000000007 | 0.001 | 0 | 0 |
| 3.948000000000007 | 0.001 | 0 | 0 |
| 3.952000000000007 | 0.001 | 0 | 0 |
| 3.956000000000007 | 0.001 | 0 | 0 |
| 3.960000000000007 | 0.001 | 0 | 0 |
| 3.964000000000007 | 0.001 | 0 | 0 |
| 3.968000000000007 | 0.001 | 0 | 0 |
| 3.972000000000007 | 0.001 | 0 | 0 |
| 3.976000000000007 | 0.001 | 0 | 0 |
| 3.980000000000007 | 0.001 | 0 | 0 |
| 3.984000000000007 | 0.001 | 0 | 0 |
| 3.988000000000007 | 0 | 0 | 0 |
| 3.992000000000007 | 0 | 0 | 0 |
| 3.996000000000007 | 0 | 0 | 0 |
| 4.000000000000006 | 0 | 0 | 0 |